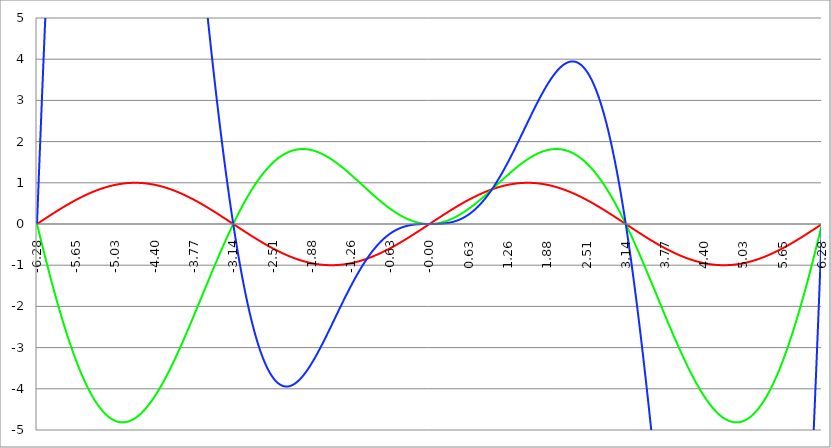
| Category | Series 1 | Series 0 | Series 2 | Series 3 | Series 4 |
|---|---|---|---|---|---|
| -6.283185307179586 | 0 | 0 | 0 |  |  |
| -6.276902121872407 | 0.006 | -0.039 | 0.248 |  |  |
| -6.270618936565228 | 0.013 | -0.079 | 0.494 |  |  |
| -6.264335751258049 | 0.019 | -0.118 | 0.74 |  |  |
| -6.25805256595087 | 0.025 | -0.157 | 0.984 |  |  |
| -6.25176938064369 | 0.031 | -0.196 | 1.228 |  |  |
| -6.245486195336511 | 0.038 | -0.235 | 1.47 |  |  |
| -6.23920301002933 | 0.044 | -0.274 | 1.712 |  |  |
| -6.232919824722153 | 0.05 | -0.313 | 1.952 |  |  |
| -6.226636639414973 | 0.057 | -0.352 | 2.191 |  |  |
| -6.220353454107794 | 0.063 | -0.391 | 2.43 |  |  |
| -6.214070268800615 | 0.069 | -0.429 | 2.667 |  |  |
| -6.207787083493435 | 0.075 | -0.468 | 2.903 |  |  |
| -6.201503898186257 | 0.082 | -0.506 | 3.138 |  |  |
| -6.195220712879077 | 0.088 | -0.544 | 3.372 |  |  |
| -6.188937527571898 | 0.094 | -0.582 | 3.605 |  |  |
| -6.182654342264719 | 0.1 | -0.621 | 3.836 |  |  |
| -6.17637115695754 | 0.107 | -0.658 | 4.067 |  |  |
| -6.170087971650361 | 0.113 | -0.696 | 4.296 |  |  |
| -6.163804786343182 | 0.119 | -0.734 | 4.525 |  |  |
| -6.157521601036002 | 0.125 | -0.772 | 4.752 |  |  |
| -6.151238415728823 | 0.132 | -0.809 | 4.978 |  |  |
| -6.144955230421644 | 0.138 | -0.847 | 5.203 |  |  |
| -6.138672045114464 | 0.144 | -0.884 | 5.427 |  |  |
| -6.132388859807286 | 0.15 | -0.921 | 5.649 |  |  |
| -6.126105674500106 | 0.156 | -0.958 | 5.871 |  |  |
| -6.119822489192927 | 0.163 | -0.995 | 6.091 |  |  |
| -6.113539303885748 | 0.169 | -1.032 | 6.31 |  |  |
| -6.107256118578569 | 0.175 | -1.069 | 6.528 |  |  |
| -6.10097293327139 | 0.181 | -1.106 | 6.745 |  |  |
| -6.09468974796421 | 0.187 | -1.142 | 6.96 |  |  |
| -6.088406562657031 | 0.194 | -1.178 | 7.175 |  |  |
| -6.082123377349852 | 0.2 | -1.215 | 7.388 |  |  |
| -6.075840192042672 | 0.206 | -1.251 | 7.6 |  |  |
| -6.069557006735494 | 0.212 | -1.287 | 7.81 |  |  |
| -6.063273821428314 | 0.218 | -1.323 | 8.02 |  |  |
| -6.056990636121135 | 0.224 | -1.358 | 8.228 |  |  |
| -6.050707450813956 | 0.23 | -1.394 | 8.435 |  |  |
| -6.044424265506777 | 0.236 | -1.43 | 8.641 |  |  |
| -6.038141080199597 | 0.243 | -1.465 | 8.845 |  |  |
| -6.031857894892418 | 0.249 | -1.5 | 9.048 |  |  |
| -6.025574709585239 | 0.255 | -1.535 | 9.25 |  |  |
| -6.01929152427806 | 0.261 | -1.57 | 9.451 |  |  |
| -6.013008338970881 | 0.267 | -1.605 | 9.65 |  |  |
| -6.006725153663701 | 0.273 | -1.64 | 9.848 |  |  |
| -6.000441968356522 | 0.279 | -1.674 | 10.045 |  |  |
| -5.994158783049343 | 0.285 | -1.708 | 10.241 |  |  |
| -5.987875597742164 | 0.291 | -1.743 | 10.435 |  |  |
| -5.981592412434984 | 0.297 | -1.777 | 10.628 |  |  |
| -5.975309227127805 | 0.303 | -1.811 | 10.82 |  |  |
| -5.969026041820626 | 0.309 | -1.845 | 11.01 |  |  |
| -5.962742856513447 | 0.315 | -1.878 | 11.199 |  |  |
| -5.956459671206268 | 0.321 | -1.912 | 11.387 |  |  |
| -5.950176485899088 | 0.327 | -1.945 | 11.573 |  |  |
| -5.94389330059191 | 0.333 | -1.978 | 11.758 |  |  |
| -5.93761011528473 | 0.339 | -2.011 | 11.942 |  |  |
| -5.931326929977551 | 0.345 | -2.044 | 12.125 |  |  |
| -5.925043744670372 | 0.351 | -2.077 | 12.306 |  |  |
| -5.918760559363193 | 0.356 | -2.11 | 12.486 |  |  |
| -5.912477374056014 | 0.362 | -2.142 | 12.664 |  |  |
| -5.906194188748834 | 0.368 | -2.174 | 12.841 |  |  |
| -5.899911003441655 | 0.374 | -2.206 | 13.017 |  |  |
| -5.893627818134476 | 0.38 | -2.238 | 13.192 |  |  |
| -5.887344632827297 | 0.386 | -2.27 | 13.365 |  |  |
| -5.881061447520117 | 0.391 | -2.302 | 13.536 |  |  |
| -5.874778262212938 | 0.397 | -2.333 | 13.707 |  |  |
| -5.868495076905759 | 0.403 | -2.364 | 13.876 |  |  |
| -5.86221189159858 | 0.409 | -2.396 | 14.043 |  |  |
| -5.855928706291401 | 0.414 | -2.427 | 14.21 |  |  |
| -5.849645520984221 | 0.42 | -2.457 | 14.375 |  |  |
| -5.843362335677042 | 0.426 | -2.488 | 14.538 |  |  |
| -5.837079150369863 | 0.431 | -2.518 | 14.7 |  |  |
| -5.830795965062684 | 0.437 | -2.549 | 14.861 |  |  |
| -5.824512779755505 | 0.443 | -2.579 | 15.021 |  |  |
| -5.818229594448325 | 0.448 | -2.609 | 15.179 |  |  |
| -5.811946409141146 | 0.454 | -2.639 | 15.335 |  |  |
| -5.805663223833967 | 0.46 | -2.668 | 15.49 |  |  |
| -5.799380038526788 | 0.465 | -2.698 | 15.644 |  |  |
| -5.793096853219609 | 0.471 | -2.727 | 15.797 |  |  |
| -5.78681366791243 | 0.476 | -2.756 | 15.948 |  |  |
| -5.780530482605251 | 0.482 | -2.785 | 16.098 |  |  |
| -5.774247297298071 | 0.487 | -2.814 | 16.246 |  |  |
| -5.767964111990892 | 0.493 | -2.842 | 16.393 |  |  |
| -5.761680926683713 | 0.498 | -2.87 | 16.538 |  |  |
| -5.755397741376534 | 0.504 | -2.899 | 16.682 |  |  |
| -5.749114556069355 | 0.509 | -2.927 | 16.825 |  |  |
| -5.742831370762175 | 0.514 | -2.954 | 16.966 |  |  |
| -5.736548185454996 | 0.52 | -2.982 | 17.106 |  |  |
| -5.730265000147816 | 0.525 | -3.009 | 17.245 |  |  |
| -5.723981814840638 | 0.531 | -3.037 | 17.382 |  |  |
| -5.717698629533459 | 0.536 | -3.064 | 17.517 |  |  |
| -5.711415444226279 | 0.541 | -3.091 | 17.652 |  |  |
| -5.7051322589191 | 0.546 | -3.117 | 17.784 |  |  |
| -5.698849073611921 | 0.552 | -3.144 | 17.916 |  |  |
| -5.692565888304742 | 0.557 | -3.17 | 18.046 |  |  |
| -5.686282702997562 | 0.562 | -3.196 | 18.174 |  |  |
| -5.679999517690383 | 0.567 | -3.222 | 18.301 |  |  |
| -5.673716332383204 | 0.572 | -3.248 | 18.427 |  |  |
| -5.667433147076025 | 0.578 | -3.273 | 18.552 |  |  |
| -5.661149961768846 | 0.583 | -3.299 | 18.674 |  |  |
| -5.654866776461667 | 0.588 | -3.324 | 18.796 |  |  |
| -5.648583591154487 | 0.593 | -3.349 | 18.916 |  |  |
| -5.642300405847308 | 0.598 | -3.374 | 19.035 |  |  |
| -5.63601722054013 | 0.603 | -3.398 | 19.152 |  |  |
| -5.62973403523295 | 0.608 | -3.422 | 19.268 |  |  |
| -5.623450849925771 | 0.613 | -3.447 | 19.382 |  |  |
| -5.617167664618591 | 0.618 | -3.471 | 19.495 |  |  |
| -5.610884479311412 | 0.623 | -3.494 | 19.607 |  |  |
| -5.604601294004233 | 0.628 | -3.518 | 19.717 |  |  |
| -5.598318108697054 | 0.633 | -3.541 | 19.825 |  |  |
| -5.592034923389875 | 0.637 | -3.564 | 19.933 |  |  |
| -5.585751738082695 | 0.642 | -3.587 | 20.039 |  |  |
| -5.579468552775516 | 0.647 | -3.61 | 20.143 |  |  |
| -5.573185367468337 | 0.652 | -3.633 | 20.246 |  |  |
| -5.566902182161157 | 0.657 | -3.655 | 20.348 |  |  |
| -5.560618996853979 | 0.661 | -3.677 | 20.448 |  |  |
| -5.5543358115468 | 0.666 | -3.699 | 20.547 |  |  |
| -5.54805262623962 | 0.671 | -3.721 | 20.644 |  |  |
| -5.54176944093244 | 0.675 | -3.743 | 20.74 |  |  |
| -5.535486255625262 | 0.68 | -3.764 | 20.835 |  |  |
| -5.529203070318083 | 0.685 | -3.785 | 20.928 |  |  |
| -5.522919885010904 | 0.689 | -3.806 | 21.02 |  |  |
| -5.516636699703724 | 0.694 | -3.827 | 21.11 |  |  |
| -5.510353514396545 | 0.698 | -3.847 | 21.199 |  |  |
| -5.504070329089366 | 0.703 | -3.867 | 21.287 |  |  |
| -5.497787143782186 | 0.707 | -3.888 | 21.373 |  |  |
| -5.491503958475008 | 0.712 | -3.907 | 21.458 |  |  |
| -5.485220773167828 | 0.716 | -3.927 | 21.541 |  |  |
| -5.47893758786065 | 0.72 | -3.947 | 21.623 |  |  |
| -5.47265440255347 | 0.725 | -3.966 | 21.703 |  |  |
| -5.466371217246291 | 0.729 | -3.985 | 21.782 |  |  |
| -5.460088031939112 | 0.733 | -4.004 | 21.86 |  |  |
| -5.453804846631932 | 0.738 | -4.022 | 21.937 |  |  |
| -5.447521661324753 | 0.742 | -4.041 | 22.012 |  |  |
| -5.441238476017574 | 0.746 | -4.059 | 22.085 |  |  |
| -5.434955290710395 | 0.75 | -4.077 | 22.157 |  |  |
| -5.428672105403215 | 0.754 | -4.095 | 22.228 |  |  |
| -5.422388920096036 | 0.758 | -4.112 | 22.298 |  |  |
| -5.416105734788857 | 0.762 | -4.129 | 22.366 |  |  |
| -5.409822549481678 | 0.766 | -4.147 | 22.432 |  |  |
| -5.403539364174499 | 0.771 | -4.163 | 22.498 |  |  |
| -5.39725617886732 | 0.775 | -4.18 | 22.562 |  |  |
| -5.39097299356014 | 0.778 | -4.197 | 22.624 |  |  |
| -5.384689808252961 | 0.782 | -4.213 | 22.685 |  |  |
| -5.378406622945782 | 0.786 | -4.229 | 22.745 |  |  |
| -5.372123437638603 | 0.79 | -4.245 | 22.804 |  |  |
| -5.365840252331424 | 0.794 | -4.26 | 22.861 |  |  |
| -5.359557067024244 | 0.798 | -4.276 | 22.917 |  |  |
| -5.353273881717065 | 0.802 | -4.291 | 22.971 |  |  |
| -5.346990696409886 | 0.805 | -4.306 | 23.024 |  |  |
| -5.340707511102707 | 0.809 | -4.321 | 23.076 |  |  |
| -5.334424325795528 | 0.813 | -4.335 | 23.126 |  |  |
| -5.328141140488348 | 0.816 | -4.35 | 23.175 |  |  |
| -5.32185795518117 | 0.82 | -4.364 | 23.223 |  |  |
| -5.31557476987399 | 0.824 | -4.378 | 23.269 |  |  |
| -5.30929158456681 | 0.827 | -4.391 | 23.314 |  |  |
| -5.303008399259631 | 0.831 | -4.405 | 23.358 |  |  |
| -5.296725213952453 | 0.834 | -4.418 | 23.4 |  |  |
| -5.290442028645273 | 0.838 | -4.431 | 23.441 |  |  |
| -5.284158843338094 | 0.841 | -4.444 | 23.481 |  |  |
| -5.277875658030915 | 0.844 | -4.456 | 23.52 |  |  |
| -5.271592472723735 | 0.848 | -4.469 | 23.557 |  |  |
| -5.265309287416557 | 0.851 | -4.481 | 23.593 |  |  |
| -5.259026102109377 | 0.854 | -4.493 | 23.627 |  |  |
| -5.252742916802198 | 0.858 | -4.504 | 23.66 |  |  |
| -5.246459731495019 | 0.861 | -4.516 | 23.692 |  |  |
| -5.24017654618784 | 0.864 | -4.527 | 23.723 |  |  |
| -5.23389336088066 | 0.867 | -4.538 | 23.752 |  |  |
| -5.227610175573481 | 0.87 | -4.549 | 23.78 |  |  |
| -5.221326990266302 | 0.873 | -4.56 | 23.807 |  |  |
| -5.215043804959122 | 0.876 | -4.57 | 23.833 |  |  |
| -5.208760619651944 | 0.879 | -4.58 | 23.857 |  |  |
| -5.202477434344764 | 0.882 | -4.59 | 23.88 |  |  |
| -5.196194249037585 | 0.885 | -4.6 | 23.902 |  |  |
| -5.189911063730406 | 0.888 | -4.609 | 23.922 |  |  |
| -5.183627878423227 | 0.891 | -4.619 | 23.941 |  |  |
| -5.177344693116048 | 0.894 | -4.628 | 23.959 |  |  |
| -5.171061507808868 | 0.897 | -4.637 | 23.976 |  |  |
| -5.164778322501689 | 0.899 | -4.645 | 23.992 |  |  |
| -5.15849513719451 | 0.902 | -4.654 | 24.006 |  |  |
| -5.152211951887331 | 0.905 | -4.662 | 24.019 |  |  |
| -5.145928766580152 | 0.907 | -4.67 | 24.031 |  |  |
| -5.139645581272972 | 0.91 | -4.678 | 24.041 |  |  |
| -5.133362395965793 | 0.913 | -4.685 | 24.051 |  |  |
| -5.127079210658614 | 0.915 | -4.693 | 24.059 |  |  |
| -5.120796025351435 | 0.918 | -4.7 | 24.066 |  |  |
| -5.114512840044256 | 0.92 | -4.707 | 24.072 |  |  |
| -5.108229654737076 | 0.923 | -4.713 | 24.076 |  |  |
| -5.101946469429897 | 0.925 | -4.72 | 24.08 |  |  |
| -5.095663284122718 | 0.927 | -4.726 | 24.082 |  |  |
| -5.08938009881554 | 0.93 | -4.732 | 24.083 |  |  |
| -5.08309691350836 | 0.932 | -4.738 | 24.083 |  |  |
| -5.07681372820118 | 0.934 | -4.743 | 24.081 |  |  |
| -5.070530542894002 | 0.937 | -4.749 | 24.079 |  |  |
| -5.064247357586822 | 0.939 | -4.754 | 24.075 |  |  |
| -5.057964172279643 | 0.941 | -4.759 | 24.071 |  |  |
| -5.051680986972464 | 0.943 | -4.764 | 24.065 |  |  |
| -5.045397801665285 | 0.945 | -4.768 | 24.058 |  |  |
| -5.039114616358106 | 0.947 | -4.773 | 24.049 |  |  |
| -5.032831431050926 | 0.949 | -4.777 | 24.04 |  |  |
| -5.026548245743747 | 0.951 | -4.781 | 24.03 |  |  |
| -5.020265060436568 | 0.953 | -4.784 | 24.018 |  |  |
| -5.013981875129389 | 0.955 | -4.788 | 24.005 |  |  |
| -5.00769868982221 | 0.957 | -4.791 | 23.992 |  |  |
| -5.00141550451503 | 0.959 | -4.794 | 23.977 |  |  |
| -4.995132319207851 | 0.96 | -4.797 | 23.961 |  |  |
| -4.98884913390067 | 0.962 | -4.799 | 23.944 |  |  |
| -4.982565948593493 | 0.964 | -4.802 | 23.925 |  |  |
| -4.976282763286313 | 0.965 | -4.804 | 23.906 |  |  |
| -4.969999577979134 | 0.967 | -4.806 | 23.886 |  |  |
| -4.963716392671955 | 0.969 | -4.808 | 23.864 |  |  |
| -4.957433207364776 | 0.97 | -4.809 | 23.842 |  |  |
| -4.951150022057597 | 0.972 | -4.811 | 23.818 |  |  |
| -4.944866836750418 | 0.973 | -4.812 | 23.794 |  |  |
| -4.938583651443238 | 0.975 | -4.813 | 23.768 |  |  |
| -4.932300466136059 | 0.976 | -4.814 | 23.742 |  |  |
| -4.92601728082888 | 0.977 | -4.814 | 23.714 |  |  |
| -4.9197340955217 | 0.979 | -4.814 | 23.685 |  |  |
| -4.913450910214521 | 0.98 | -4.814 | 23.656 |  |  |
| -4.907167724907342 | 0.981 | -4.814 | 23.625 |  |  |
| -4.900884539600163 | 0.982 | -4.814 | 23.593 |  |  |
| -4.894601354292984 | 0.983 | -4.814 | 23.561 |  |  |
| -4.888318168985805 | 0.985 | -4.813 | 23.527 |  |  |
| -4.882034983678625 | 0.986 | -4.812 | 23.492 |  |  |
| -4.875751798371446 | 0.987 | -4.811 | 23.456 |  |  |
| -4.869468613064267 | 0.988 | -4.81 | 23.42 |  |  |
| -4.863185427757088 | 0.989 | -4.808 | 23.382 |  |  |
| -4.856902242449909 | 0.99 | -4.806 | 23.344 |  |  |
| -4.85061905714273 | 0.99 | -4.804 | 23.304 |  |  |
| -4.84433587183555 | 0.991 | -4.802 | 23.264 |  |  |
| -4.838052686528371 | 0.992 | -4.8 | 23.222 |  |  |
| -4.831769501221192 | 0.993 | -4.797 | 23.18 |  |  |
| -4.825486315914013 | 0.994 | -4.795 | 23.137 |  |  |
| -4.819203130606833 | 0.994 | -4.792 | 23.092 |  |  |
| -4.812919945299654 | 0.995 | -4.789 | 23.047 |  |  |
| -4.806636759992475 | 0.996 | -4.785 | 23.001 |  |  |
| -4.800353574685296 | 0.996 | -4.782 | 22.954 |  |  |
| -4.794070389378117 | 0.997 | -4.778 | 22.906 |  |  |
| -4.787787204070938 | 0.997 | -4.774 | 22.858 |  |  |
| -4.781504018763758 | 0.998 | -4.77 | 22.808 |  |  |
| -4.77522083345658 | 0.998 | -4.766 | 22.758 |  |  |
| -4.7689376481494 | 0.998 | -4.761 | 22.706 |  |  |
| -4.762654462842221 | 0.999 | -4.757 | 22.654 |  |  |
| -4.756371277535042 | 0.999 | -4.752 | 22.601 |  |  |
| -4.750088092227862 | 0.999 | -4.747 | 22.547 |  |  |
| -4.743804906920683 | 1 | -4.741 | 22.493 |  |  |
| -4.737521721613504 | 1 | -4.736 | 22.437 |  |  |
| -4.731238536306324 | 1 | -4.73 | 22.381 |  |  |
| -4.724955350999146 | 1 | -4.725 | 22.323 |  |  |
| -4.718672165691966 | 1 | -4.719 | 22.265 |  |  |
| -4.712388980384787 | 1 | -4.712 | 22.207 |  |  |
| -4.706105795077608 | 1 | -4.706 | 22.147 |  |  |
| -4.699822609770429 | 1 | -4.699 | 22.087 |  |  |
| -4.69353942446325 | 1 | -4.693 | 22.025 |  |  |
| -4.68725623915607 | 1 | -4.686 | 21.963 |  |  |
| -4.680973053848891 | 1 | -4.679 | 21.901 |  |  |
| -4.674689868541712 | 0.999 | -4.671 | 21.837 |  |  |
| -4.668406683234533 | 0.999 | -4.664 | 21.773 |  |  |
| -4.662123497927354 | 0.999 | -4.656 | 21.708 |  |  |
| -4.655840312620174 | 0.998 | -4.648 | 21.642 |  |  |
| -4.649557127312995 | 0.998 | -4.64 | 21.576 |  |  |
| -4.643273942005816 | 0.998 | -4.632 | 21.509 |  |  |
| -4.636990756698637 | 0.997 | -4.624 | 21.441 |  |  |
| -4.630707571391458 | 0.997 | -4.615 | 21.372 |  |  |
| -4.624424386084279 | 0.996 | -4.607 | 21.303 |  |  |
| -4.618141200777099 | 0.996 | -4.598 | 21.233 |  |  |
| -4.61185801546992 | 0.995 | -4.589 | 21.162 |  |  |
| -4.605574830162741 | 0.994 | -4.579 | 21.09 |  |  |
| -4.599291644855561 | 0.994 | -4.57 | 21.018 |  |  |
| -4.593008459548383 | 0.993 | -4.56 | 20.946 |  |  |
| -4.586725274241203 | 0.992 | -4.551 | 20.872 |  |  |
| -4.580442088934024 | 0.991 | -4.541 | 20.798 |  |  |
| -4.574158903626845 | 0.99 | -4.531 | 20.723 |  |  |
| -4.567875718319666 | 0.99 | -4.52 | 20.648 |  |  |
| -4.561592533012487 | 0.989 | -4.51 | 20.572 |  |  |
| -4.555309347705307 | 0.988 | -4.499 | 20.495 |  |  |
| -4.549026162398128 | 0.987 | -4.488 | 20.418 |  |  |
| -4.542742977090949 | 0.986 | -4.478 | 20.34 |  |  |
| -4.53645979178377 | 0.985 | -4.466 | 20.262 |  |  |
| -4.530176606476591 | 0.983 | -4.455 | 20.183 |  |  |
| -4.523893421169412 | 0.982 | -4.444 | 20.103 |  |  |
| -4.517610235862232 | 0.981 | -4.432 | 20.023 |  |  |
| -4.511327050555053 | 0.98 | -4.42 | 19.942 |  |  |
| -4.505043865247874 | 0.979 | -4.409 | 19.861 |  |  |
| -4.498760679940694 | 0.977 | -4.396 | 19.779 |  |  |
| -4.492477494633515 | 0.976 | -4.384 | 19.696 |  |  |
| -4.486194309326336 | 0.975 | -4.372 | 19.613 |  |  |
| -4.479911124019157 | 0.973 | -4.359 | 19.53 |  |  |
| -4.473627938711977 | 0.972 | -4.347 | 19.446 |  |  |
| -4.467344753404799 | 0.97 | -4.334 | 19.361 |  |  |
| -4.46106156809762 | 0.969 | -4.321 | 19.276 |  |  |
| -4.45477838279044 | 0.967 | -4.308 | 19.19 |  |  |
| -4.44849519748326 | 0.965 | -4.294 | 19.104 |  |  |
| -4.442212012176082 | 0.964 | -4.281 | 19.017 |  |  |
| -4.435928826868903 | 0.962 | -4.267 | 18.93 |  |  |
| -4.429645641561723 | 0.96 | -4.254 | 18.843 |  |  |
| -4.423362456254544 | 0.959 | -4.24 | 18.755 |  |  |
| -4.417079270947365 | 0.957 | -4.226 | 18.666 |  |  |
| -4.410796085640185 | 0.955 | -4.212 | 18.577 |  |  |
| -4.404512900333007 | 0.953 | -4.197 | 18.488 |  |  |
| -4.398229715025827 | 0.951 | -4.183 | 18.398 |  |  |
| -4.391946529718648 | 0.949 | -4.168 | 18.307 |  |  |
| -4.38566334441147 | 0.947 | -4.154 | 18.217 |  |  |
| -4.37938015910429 | 0.945 | -4.139 | 18.125 |  |  |
| -4.373096973797111 | 0.943 | -4.124 | 18.034 |  |  |
| -4.366813788489932 | 0.941 | -4.109 | 17.942 |  |  |
| -4.360530603182752 | 0.939 | -4.093 | 17.849 |  |  |
| -4.354247417875573 | 0.937 | -4.078 | 17.756 |  |  |
| -4.347964232568394 | 0.934 | -4.062 | 17.663 |  |  |
| -4.341681047261215 | 0.932 | -4.047 | 17.57 |  |  |
| -4.335397861954035 | 0.93 | -4.031 | 17.476 |  |  |
| -4.329114676646856 | 0.927 | -4.015 | 17.381 |  |  |
| -4.322831491339677 | 0.925 | -3.999 | 17.287 |  |  |
| -4.316548306032498 | 0.923 | -3.983 | 17.192 |  |  |
| -4.310265120725319 | 0.92 | -3.966 | 17.096 |  |  |
| -4.30398193541814 | 0.918 | -3.95 | 17.001 |  |  |
| -4.29769875011096 | 0.915 | -3.933 | 16.905 |  |  |
| -4.291415564803781 | 0.913 | -3.917 | 16.808 |  |  |
| -4.285132379496602 | 0.91 | -3.9 | 16.712 |  |  |
| -4.278849194189422 | 0.907 | -3.883 | 16.615 |  |  |
| -4.272566008882244 | 0.905 | -3.866 | 16.517 |  |  |
| -4.266282823575064 | 0.902 | -3.849 | 16.42 |  |  |
| -4.259999638267885 | 0.899 | -3.831 | 16.322 |  |  |
| -4.253716452960706 | 0.897 | -3.814 | 16.224 |  |  |
| -4.247433267653527 | 0.894 | -3.797 | 16.126 |  |  |
| -4.241150082346347 | 0.891 | -3.779 | 16.027 |  |  |
| -4.234866897039168 | 0.888 | -3.761 | 15.928 |  |  |
| -4.228583711731989 | 0.885 | -3.743 | 15.829 |  |  |
| -4.22230052642481 | 0.882 | -3.725 | 15.729 |  |  |
| -4.216017341117631 | 0.879 | -3.707 | 15.63 |  |  |
| -4.209734155810452 | 0.876 | -3.689 | 15.53 |  |  |
| -4.203450970503273 | 0.873 | -3.671 | 15.43 |  |  |
| -4.197167785196093 | 0.87 | -3.652 | 15.329 |  |  |
| -4.190884599888914 | 0.867 | -3.634 | 15.229 |  |  |
| -4.184601414581734 | 0.864 | -3.615 | 15.128 |  |  |
| -4.178318229274556 | 0.861 | -3.596 | 15.027 |  |  |
| -4.172035043967377 | 0.858 | -3.578 | 14.926 |  |  |
| -4.165751858660197 | 0.854 | -3.559 | 14.825 |  |  |
| -4.159468673353018 | 0.851 | -3.54 | 14.723 |  |  |
| -4.153185488045839 | 0.848 | -3.521 | 14.622 |  |  |
| -4.14690230273866 | 0.844 | -3.501 | 14.52 |  |  |
| -4.140619117431481 | 0.841 | -3.482 | 14.418 |  |  |
| -4.134335932124301 | 0.838 | -3.463 | 14.316 |  |  |
| -4.128052746817122 | 0.834 | -3.443 | 14.213 |  |  |
| -4.121769561509943 | 0.831 | -3.424 | 14.111 |  |  |
| -4.115486376202764 | 0.827 | -3.404 | 14.008 |  |  |
| -4.109203190895584 | 0.824 | -3.384 | 13.906 |  |  |
| -4.102920005588405 | 0.82 | -3.364 | 13.803 |  |  |
| -4.096636820281226 | 0.816 | -3.344 | 13.7 |  |  |
| -4.090353634974047 | 0.813 | -3.324 | 13.597 |  |  |
| -4.084070449666868 | 0.809 | -3.304 | 13.494 |  |  |
| -4.077787264359689 | 0.805 | -3.284 | 13.391 |  |  |
| -4.071504079052509 | 0.802 | -3.264 | 13.288 |  |  |
| -4.06522089374533 | 0.798 | -3.243 | 13.184 |  |  |
| -4.058937708438151 | 0.794 | -3.223 | 13.081 |  |  |
| -4.052654523130972 | 0.79 | -3.202 | 12.978 |  |  |
| -4.046371337823793 | 0.786 | -3.182 | 12.874 |  |  |
| -4.040088152516613 | 0.782 | -3.161 | 12.77 |  |  |
| -4.033804967209434 | 0.778 | -3.14 | 12.667 |  |  |
| -4.027521781902255 | 0.775 | -3.119 | 12.563 |  |  |
| -4.021238596595076 | 0.771 | -3.098 | 12.459 |  |  |
| -4.014955411287897 | 0.766 | -3.077 | 12.356 |  |  |
| -4.008672225980717 | 0.762 | -3.056 | 12.252 |  |  |
| -4.002389040673538 | 0.758 | -3.035 | 12.148 |  |  |
| -3.996105855366359 | 0.754 | -3.014 | 12.045 |  |  |
| -3.989822670059179 | 0.75 | -2.993 | 11.941 |  |  |
| -3.983539484752 | 0.746 | -2.971 | 11.837 |  |  |
| -3.97725629944482 | 0.742 | -2.95 | 11.733 |  |  |
| -3.97097311413764 | 0.738 | -2.929 | 11.63 |  |  |
| -3.96468992883046 | 0.733 | -2.907 | 11.526 |  |  |
| -3.958406743523281 | 0.729 | -2.886 | 11.422 |  |  |
| -3.952123558216101 | 0.725 | -2.864 | 11.319 |  |  |
| -3.945840372908922 | 0.72 | -2.842 | 11.215 |  |  |
| -3.939557187601742 | 0.716 | -2.82 | 11.111 |  |  |
| -3.933274002294562 | 0.712 | -2.799 | 11.008 |  |  |
| -3.926990816987382 | 0.707 | -2.777 | 10.904 |  |  |
| -3.920707631680203 | 0.703 | -2.755 | 10.801 |  |  |
| -3.914424446373023 | 0.698 | -2.733 | 10.698 |  |  |
| -3.908141261065844 | 0.694 | -2.711 | 10.595 |  |  |
| -3.901858075758664 | 0.689 | -2.689 | 10.491 |  |  |
| -3.895574890451484 | 0.685 | -2.667 | 10.388 |  |  |
| -3.889291705144305 | 0.68 | -2.645 | 10.285 |  |  |
| -3.883008519837125 | 0.675 | -2.622 | 10.183 |  |  |
| -3.876725334529945 | 0.671 | -2.6 | 10.08 |  |  |
| -3.870442149222766 | 0.666 | -2.578 | 9.977 |  |  |
| -3.864158963915586 | 0.661 | -2.555 | 9.875 |  |  |
| -3.857875778608407 | 0.657 | -2.533 | 9.772 |  |  |
| -3.851592593301227 | 0.652 | -2.511 | 9.67 |  |  |
| -3.845309407994047 | 0.647 | -2.488 | 9.568 |  |  |
| -3.839026222686868 | 0.642 | -2.466 | 9.466 |  |  |
| -3.832743037379688 | 0.637 | -2.443 | 9.364 |  |  |
| -3.826459852072508 | 0.633 | -2.421 | 9.262 |  |  |
| -3.820176666765329 | 0.628 | -2.398 | 9.16 |  |  |
| -3.813893481458149 | 0.623 | -2.375 | 9.059 |  |  |
| -3.807610296150969 | 0.618 | -2.353 | 8.958 |  |  |
| -3.80132711084379 | 0.613 | -2.33 | 8.857 |  |  |
| -3.79504392553661 | 0.608 | -2.307 | 8.756 |  |  |
| -3.78876074022943 | 0.603 | -2.284 | 8.655 |  |  |
| -3.782477554922251 | 0.598 | -2.262 | 8.554 |  |  |
| -3.776194369615071 | 0.593 | -2.239 | 8.454 |  |  |
| -3.769911184307892 | 0.588 | -2.216 | 8.354 |  |  |
| -3.763627999000712 | 0.583 | -2.193 | 8.254 |  |  |
| -3.757344813693532 | 0.578 | -2.17 | 8.154 |  |  |
| -3.751061628386352 | 0.572 | -2.147 | 8.054 |  |  |
| -3.744778443079173 | 0.567 | -2.124 | 7.955 |  |  |
| -3.738495257771993 | 0.562 | -2.101 | 7.856 |  |  |
| -3.732212072464814 | 0.557 | -2.078 | 7.757 |  |  |
| -3.725928887157634 | 0.552 | -2.055 | 7.658 |  |  |
| -3.719645701850454 | 0.546 | -2.032 | 7.56 |  |  |
| -3.713362516543275 | 0.541 | -2.009 | 7.462 |  |  |
| -3.707079331236095 | 0.536 | -1.986 | 7.364 |  |  |
| -3.700796145928915 | 0.531 | -1.963 | 7.266 |  |  |
| -3.694512960621736 | 0.525 | -1.94 | 7.168 |  |  |
| -3.688229775314556 | 0.52 | -1.917 | 7.071 |  |  |
| -3.681946590007376 | 0.514 | -1.894 | 6.974 |  |  |
| -3.675663404700197 | 0.509 | -1.871 | 6.877 |  |  |
| -3.669380219393017 | 0.504 | -1.848 | 6.781 |  |  |
| -3.663097034085838 | 0.498 | -1.825 | 6.685 |  |  |
| -3.656813848778658 | 0.493 | -1.802 | 6.589 |  |  |
| -3.650530663471478 | 0.487 | -1.779 | 6.493 |  |  |
| -3.644247478164299 | 0.482 | -1.756 | 6.398 |  |  |
| -3.63796429285712 | 0.476 | -1.733 | 6.303 |  |  |
| -3.631681107549939 | 0.471 | -1.709 | 6.208 |  |  |
| -3.62539792224276 | 0.465 | -1.686 | 6.114 |  |  |
| -3.61911473693558 | 0.46 | -1.663 | 6.02 |  |  |
| -3.612831551628401 | 0.454 | -1.64 | 5.926 |  |  |
| -3.606548366321221 | 0.448 | -1.617 | 5.832 |  |  |
| -3.600265181014041 | 0.443 | -1.594 | 5.739 |  |  |
| -3.593981995706862 | 0.437 | -1.571 | 5.646 |  |  |
| -3.587698810399682 | 0.431 | -1.548 | 5.554 |  |  |
| -3.581415625092502 | 0.426 | -1.525 | 5.461 |  |  |
| -3.575132439785323 | 0.42 | -1.502 | 5.369 |  |  |
| -3.568849254478143 | 0.414 | -1.479 | 5.278 |  |  |
| -3.562566069170964 | 0.409 | -1.456 | 5.187 |  |  |
| -3.556282883863784 | 0.403 | -1.433 | 5.096 |  |  |
| -3.549999698556604 | 0.397 | -1.41 | 5.005 |  |  |
| -3.543716513249425 | 0.391 | -1.387 | 4.915 |  |  |
| -3.537433327942245 | 0.386 | -1.364 | 4.825 |  |  |
| -3.531150142635065 | 0.38 | -1.341 | 4.735 |  |  |
| -3.524866957327886 | 0.374 | -1.318 | 4.646 |  |  |
| -3.518583772020706 | 0.368 | -1.295 | 4.558 |  |  |
| -3.512300586713526 | 0.362 | -1.272 | 4.469 |  |  |
| -3.506017401406347 | 0.356 | -1.25 | 4.381 |  |  |
| -3.499734216099167 | 0.351 | -1.227 | 4.293 |  |  |
| -3.493451030791987 | 0.345 | -1.204 | 4.206 |  |  |
| -3.487167845484808 | 0.339 | -1.181 | 4.119 |  |  |
| -3.480884660177628 | 0.333 | -1.159 | 4.033 |  |  |
| -3.474601474870449 | 0.327 | -1.136 | 3.946 |  |  |
| -3.468318289563269 | 0.321 | -1.113 | 3.861 |  |  |
| -3.462035104256089 | 0.315 | -1.09 | 3.775 |  |  |
| -3.45575191894891 | 0.309 | -1.068 | 3.69 |  |  |
| -3.44946873364173 | 0.303 | -1.045 | 3.606 |  |  |
| -3.44318554833455 | 0.297 | -1.023 | 3.522 |  |  |
| -3.436902363027371 | 0.291 | -1 | 3.438 |  |  |
| -3.430619177720191 | 0.285 | -0.978 | 3.354 |  |  |
| -3.424335992413011 | 0.279 | -0.955 | 3.271 |  |  |
| -3.418052807105832 | 0.273 | -0.933 | 3.189 |  |  |
| -3.411769621798652 | 0.267 | -0.911 | 3.107 |  |  |
| -3.405486436491473 | 0.261 | -0.888 | 3.025 |  |  |
| -3.399203251184293 | 0.255 | -0.866 | 2.944 |  |  |
| -3.392920065877113 | 0.249 | -0.844 | 2.863 |  |  |
| -3.386636880569934 | 0.243 | -0.822 | 2.782 |  |  |
| -3.380353695262754 | 0.236 | -0.799 | 2.702 |  |  |
| -3.374070509955574 | 0.23 | -0.777 | 2.623 |  |  |
| -3.367787324648395 | 0.224 | -0.755 | 2.544 |  |  |
| -3.361504139341215 | 0.218 | -0.733 | 2.465 |  |  |
| -3.355220954034035 | 0.212 | -0.711 | 2.387 |  |  |
| -3.348937768726855 | 0.206 | -0.689 | 2.309 |  |  |
| -3.342654583419676 | 0.2 | -0.668 | 2.231 |  |  |
| -3.336371398112496 | 0.194 | -0.646 | 2.154 |  |  |
| -3.330088212805317 | 0.187 | -0.624 | 2.078 |  |  |
| -3.323805027498137 | 0.181 | -0.602 | 2.002 |  |  |
| -3.317521842190957 | 0.175 | -0.581 | 1.926 |  |  |
| -3.311238656883778 | 0.169 | -0.559 | 1.851 |  |  |
| -3.304955471576598 | 0.163 | -0.538 | 1.776 |  |  |
| -3.298672286269419 | 0.156 | -0.516 | 1.702 |  |  |
| -3.292389100962239 | 0.15 | -0.495 | 1.628 |  |  |
| -3.286105915655059 | 0.144 | -0.473 | 1.555 |  |  |
| -3.27982273034788 | 0.138 | -0.452 | 1.482 |  |  |
| -3.2735395450407 | 0.132 | -0.431 | 1.41 |  |  |
| -3.26725635973352 | 0.125 | -0.409 | 1.338 |  |  |
| -3.260973174426341 | 0.119 | -0.388 | 1.266 |  |  |
| -3.254689989119161 | 0.113 | -0.367 | 1.195 |  |  |
| -3.248406803811982 | 0.107 | -0.346 | 1.125 |  |  |
| -3.242123618504802 | 0.1 | -0.325 | 1.055 |  |  |
| -3.235840433197622 | 0.094 | -0.305 | 0.985 |  |  |
| -3.229557247890442 | 0.088 | -0.284 | 0.916 |  |  |
| -3.223274062583263 | 0.082 | -0.263 | 0.848 |  |  |
| -3.216990877276083 | 0.075 | -0.242 | 0.78 |  |  |
| -3.210707691968904 | 0.069 | -0.222 | 0.712 |  |  |
| -3.204424506661724 | 0.063 | -0.201 | 0.645 |  |  |
| -3.198141321354544 | 0.057 | -0.181 | 0.578 |  |  |
| -3.191858136047365 | 0.05 | -0.16 | 0.512 |  |  |
| -3.185574950740185 | 0.044 | -0.14 | 0.446 |  |  |
| -3.179291765433005 | 0.038 | -0.12 | 0.381 |  |  |
| -3.173008580125826 | 0.031 | -0.1 | 0.316 |  |  |
| -3.166725394818646 | 0.025 | -0.08 | 0.252 |  |  |
| -3.160442209511467 | 0.019 | -0.06 | 0.188 |  |  |
| -3.154159024204287 | 0.013 | -0.04 | 0.125 |  |  |
| -3.147875838897107 | 0.006 | -0.02 | 0.062 |  |  |
| -3.141592653589928 | 0 | 0 | 0 |  |  |
| -3.135309468282748 | -0.006 | 0.02 | -0.062 |  |  |
| -3.129026282975568 | -0.013 | 0.039 | -0.123 |  |  |
| -3.122743097668389 | -0.019 | 0.059 | -0.184 |  |  |
| -3.116459912361209 | -0.025 | 0.078 | -0.244 |  |  |
| -3.110176727054029 | -0.031 | 0.098 | -0.304 |  |  |
| -3.10389354174685 | -0.038 | 0.117 | -0.363 |  |  |
| -3.09761035643967 | -0.044 | 0.136 | -0.422 |  |  |
| -3.09132717113249 | -0.05 | 0.155 | -0.48 |  |  |
| -3.085043985825311 | -0.057 | 0.174 | -0.538 |  |  |
| -3.078760800518131 | -0.063 | 0.193 | -0.595 |  |  |
| -3.072477615210952 | -0.069 | 0.212 | -0.652 |  |  |
| -3.066194429903772 | -0.075 | 0.231 | -0.708 |  |  |
| -3.059911244596592 | -0.082 | 0.25 | -0.764 |  |  |
| -3.053628059289413 | -0.088 | 0.268 | -0.819 |  |  |
| -3.047344873982233 | -0.094 | 0.287 | -0.874 |  |  |
| -3.041061688675053 | -0.1 | 0.305 | -0.928 |  |  |
| -3.034778503367874 | -0.107 | 0.324 | -0.982 |  |  |
| -3.028495318060694 | -0.113 | 0.342 | -1.035 |  |  |
| -3.022212132753515 | -0.119 | 0.36 | -1.088 |  |  |
| -3.015928947446335 | -0.125 | 0.378 | -1.14 |  |  |
| -3.009645762139155 | -0.132 | 0.396 | -1.192 |  |  |
| -3.003362576831975 | -0.138 | 0.414 | -1.243 |  |  |
| -2.997079391524796 | -0.144 | 0.432 | -1.294 |  |  |
| -2.990796206217616 | -0.15 | 0.449 | -1.344 |  |  |
| -2.984513020910436 | -0.156 | 0.467 | -1.393 |  |  |
| -2.978229835603257 | -0.163 | 0.484 | -1.443 |  |  |
| -2.971946650296077 | -0.169 | 0.502 | -1.491 |  |  |
| -2.965663464988898 | -0.175 | 0.519 | -1.539 |  |  |
| -2.959380279681718 | -0.181 | 0.536 | -1.587 |  |  |
| -2.953097094374538 | -0.187 | 0.553 | -1.634 |  |  |
| -2.946813909067359 | -0.194 | 0.57 | -1.681 |  |  |
| -2.94053072376018 | -0.2 | 0.587 | -1.727 |  |  |
| -2.934247538453 | -0.206 | 0.604 | -1.772 |  |  |
| -2.92796435314582 | -0.212 | 0.621 | -1.818 |  |  |
| -2.92168116783864 | -0.218 | 0.637 | -1.862 |  |  |
| -2.915397982531461 | -0.224 | 0.654 | -1.906 |  |  |
| -2.909114797224281 | -0.23 | 0.67 | -1.95 |  |  |
| -2.902831611917101 | -0.236 | 0.687 | -1.993 |  |  |
| -2.896548426609922 | -0.243 | 0.703 | -2.035 |  |  |
| -2.890265241302742 | -0.249 | 0.719 | -2.077 |  |  |
| -2.883982055995562 | -0.255 | 0.735 | -2.119 |  |  |
| -2.877698870688383 | -0.261 | 0.751 | -2.16 |  |  |
| -2.871415685381203 | -0.267 | 0.766 | -2.201 |  |  |
| -2.865132500074023 | -0.273 | 0.782 | -2.241 |  |  |
| -2.858849314766844 | -0.279 | 0.798 | -2.28 |  |  |
| -2.852566129459664 | -0.285 | 0.813 | -2.319 |  |  |
| -2.846282944152485 | -0.291 | 0.828 | -2.358 |  |  |
| -2.839999758845305 | -0.297 | 0.844 | -2.396 |  |  |
| -2.833716573538125 | -0.303 | 0.859 | -2.433 |  |  |
| -2.827433388230946 | -0.309 | 0.874 | -2.47 |  |  |
| -2.821150202923766 | -0.315 | 0.889 | -2.507 |  |  |
| -2.814867017616586 | -0.321 | 0.903 | -2.543 |  |  |
| -2.808583832309407 | -0.327 | 0.918 | -2.579 |  |  |
| -2.802300647002227 | -0.333 | 0.933 | -2.614 |  |  |
| -2.796017461695047 | -0.339 | 0.947 | -2.648 |  |  |
| -2.789734276387867 | -0.345 | 0.961 | -2.682 |  |  |
| -2.783451091080688 | -0.351 | 0.976 | -2.716 |  |  |
| -2.777167905773509 | -0.356 | 0.99 | -2.749 |  |  |
| -2.770884720466329 | -0.362 | 1.004 | -2.781 |  |  |
| -2.764601535159149 | -0.368 | 1.018 | -2.814 |  |  |
| -2.75831834985197 | -0.374 | 1.031 | -2.845 |  |  |
| -2.75203516454479 | -0.38 | 1.045 | -2.876 |  |  |
| -2.74575197923761 | -0.386 | 1.059 | -2.907 |  |  |
| -2.739468793930431 | -0.391 | 1.072 | -2.937 |  |  |
| -2.733185608623251 | -0.397 | 1.085 | -2.967 |  |  |
| -2.726902423316071 | -0.403 | 1.099 | -2.996 |  |  |
| -2.720619238008892 | -0.409 | 1.112 | -3.025 |  |  |
| -2.714336052701712 | -0.414 | 1.125 | -3.053 |  |  |
| -2.708052867394532 | -0.42 | 1.138 | -3.081 |  |  |
| -2.701769682087352 | -0.426 | 1.15 | -3.108 |  |  |
| -2.695486496780173 | -0.431 | 1.163 | -3.135 |  |  |
| -2.689203311472993 | -0.437 | 1.175 | -3.161 |  |  |
| -2.682920126165814 | -0.443 | 1.188 | -3.187 |  |  |
| -2.676636940858634 | -0.448 | 1.2 | -3.212 |  |  |
| -2.670353755551454 | -0.454 | 1.212 | -3.237 |  |  |
| -2.664070570244275 | -0.46 | 1.224 | -3.262 |  |  |
| -2.657787384937095 | -0.465 | 1.236 | -3.286 |  |  |
| -2.651504199629916 | -0.471 | 1.248 | -3.309 |  |  |
| -2.645221014322736 | -0.476 | 1.26 | -3.332 |  |  |
| -2.638937829015556 | -0.482 | 1.271 | -3.355 |  |  |
| -2.632654643708377 | -0.487 | 1.283 | -3.377 |  |  |
| -2.626371458401197 | -0.493 | 1.294 | -3.399 |  |  |
| -2.620088273094018 | -0.498 | 1.305 | -3.42 |  |  |
| -2.613805087786838 | -0.504 | 1.316 | -3.441 |  |  |
| -2.607521902479658 | -0.509 | 1.327 | -3.461 |  |  |
| -2.601238717172478 | -0.514 | 1.338 | -3.481 |  |  |
| -2.594955531865299 | -0.52 | 1.349 | -3.5 |  |  |
| -2.588672346558119 | -0.525 | 1.36 | -3.519 |  |  |
| -2.58238916125094 | -0.531 | 1.37 | -3.538 |  |  |
| -2.57610597594376 | -0.536 | 1.38 | -3.556 |  |  |
| -2.56982279063658 | -0.541 | 1.391 | -3.574 |  |  |
| -2.563539605329401 | -0.546 | 1.401 | -3.591 |  |  |
| -2.557256420022221 | -0.552 | 1.411 | -3.608 |  |  |
| -2.550973234715042 | -0.557 | 1.421 | -3.624 |  |  |
| -2.544690049407862 | -0.562 | 1.43 | -3.64 |  |  |
| -2.538406864100682 | -0.567 | 1.44 | -3.655 |  |  |
| -2.532123678793503 | -0.572 | 1.449 | -3.67 |  |  |
| -2.525840493486323 | -0.578 | 1.459 | -3.685 |  |  |
| -2.519557308179143 | -0.583 | 1.468 | -3.699 |  |  |
| -2.513274122871964 | -0.588 | 1.477 | -3.713 |  |  |
| -2.506990937564784 | -0.593 | 1.486 | -3.726 |  |  |
| -2.500707752257604 | -0.598 | 1.495 | -3.739 |  |  |
| -2.494424566950425 | -0.603 | 1.504 | -3.752 |  |  |
| -2.488141381643245 | -0.608 | 1.513 | -3.764 |  |  |
| -2.481858196336065 | -0.613 | 1.521 | -3.775 |  |  |
| -2.475575011028886 | -0.618 | 1.53 | -3.787 |  |  |
| -2.469291825721706 | -0.623 | 1.538 | -3.797 |  |  |
| -2.463008640414527 | -0.628 | 1.546 | -3.808 |  |  |
| -2.456725455107347 | -0.633 | 1.554 | -3.818 |  |  |
| -2.450442269800167 | -0.637 | 1.562 | -3.828 |  |  |
| -2.444159084492988 | -0.642 | 1.57 | -3.837 |  |  |
| -2.437875899185808 | -0.647 | 1.577 | -3.846 |  |  |
| -2.431592713878628 | -0.652 | 1.585 | -3.854 |  |  |
| -2.425309528571449 | -0.657 | 1.592 | -3.862 |  |  |
| -2.419026343264269 | -0.661 | 1.6 | -3.87 |  |  |
| -2.412743157957089 | -0.666 | 1.607 | -3.877 |  |  |
| -2.40645997264991 | -0.671 | 1.614 | -3.884 |  |  |
| -2.40017678734273 | -0.675 | 1.621 | -3.89 |  |  |
| -2.393893602035551 | -0.68 | 1.628 | -3.897 |  |  |
| -2.387610416728371 | -0.685 | 1.634 | -3.902 |  |  |
| -2.381327231421191 | -0.689 | 1.641 | -3.908 |  |  |
| -2.375044046114012 | -0.694 | 1.647 | -3.913 |  |  |
| -2.368760860806832 | -0.698 | 1.654 | -3.917 |  |  |
| -2.362477675499652 | -0.703 | 1.66 | -3.922 |  |  |
| -2.356194490192473 | -0.707 | 1.666 | -3.926 |  |  |
| -2.349911304885293 | -0.712 | 1.672 | -3.929 |  |  |
| -2.343628119578113 | -0.716 | 1.678 | -3.932 |  |  |
| -2.337344934270934 | -0.72 | 1.684 | -3.935 |  |  |
| -2.331061748963754 | -0.725 | 1.689 | -3.938 |  |  |
| -2.324778563656574 | -0.729 | 1.695 | -3.94 |  |  |
| -2.318495378349395 | -0.733 | 1.7 | -3.942 |  |  |
| -2.312212193042215 | -0.738 | 1.705 | -3.943 |  |  |
| -2.305929007735036 | -0.742 | 1.71 | -3.944 |  |  |
| -2.299645822427856 | -0.746 | 1.715 | -3.945 |  |  |
| -2.293362637120676 | -0.75 | 1.72 | -3.945 |  |  |
| -2.287079451813496 | -0.754 | 1.725 | -3.945 |  |  |
| -2.280796266506317 | -0.758 | 1.73 | -3.945 |  |  |
| -2.274513081199137 | -0.762 | 1.734 | -3.944 |  |  |
| -2.268229895891957 | -0.766 | 1.739 | -3.944 |  |  |
| -2.261946710584778 | -0.771 | 1.743 | -3.942 |  |  |
| -2.255663525277598 | -0.775 | 1.747 | -3.941 |  |  |
| -2.249380339970419 | -0.778 | 1.751 | -3.939 |  |  |
| -2.24309715466324 | -0.782 | 1.755 | -3.937 |  |  |
| -2.23681396935606 | -0.786 | 1.759 | -3.934 |  |  |
| -2.23053078404888 | -0.79 | 1.762 | -3.931 |  |  |
| -2.2242475987417 | -0.794 | 1.766 | -3.928 |  |  |
| -2.217964413434521 | -0.798 | 1.769 | -3.925 |  |  |
| -2.211681228127341 | -0.802 | 1.773 | -3.921 |  |  |
| -2.205398042820161 | -0.805 | 1.776 | -3.917 |  |  |
| -2.199114857512981 | -0.809 | 1.779 | -3.912 |  |  |
| -2.192831672205802 | -0.813 | 1.782 | -3.908 |  |  |
| -2.186548486898622 | -0.816 | 1.785 | -3.903 |  |  |
| -2.180265301591443 | -0.82 | 1.788 | -3.898 |  |  |
| -2.173982116284263 | -0.824 | 1.79 | -3.892 |  |  |
| -2.167698930977084 | -0.827 | 1.793 | -3.886 |  |  |
| -2.161415745669904 | -0.831 | 1.795 | -3.88 |  |  |
| -2.155132560362724 | -0.834 | 1.798 | -3.874 |  |  |
| -2.148849375055545 | -0.838 | 1.8 | -3.867 |  |  |
| -2.142566189748365 | -0.841 | 1.802 | -3.86 |  |  |
| -2.136283004441185 | -0.844 | 1.804 | -3.853 |  |  |
| -2.129999819134006 | -0.848 | 1.806 | -3.846 |  |  |
| -2.123716633826826 | -0.851 | 1.807 | -3.838 |  |  |
| -2.117433448519646 | -0.854 | 1.809 | -3.83 |  |  |
| -2.111150263212467 | -0.858 | 1.81 | -3.822 |  |  |
| -2.104867077905287 | -0.861 | 1.812 | -3.813 |  |  |
| -2.098583892598107 | -0.864 | 1.813 | -3.805 |  |  |
| -2.092300707290928 | -0.867 | 1.814 | -3.796 |  |  |
| -2.086017521983748 | -0.87 | 1.815 | -3.787 |  |  |
| -2.079734336676569 | -0.873 | 1.816 | -3.777 |  |  |
| -2.073451151369389 | -0.876 | 1.817 | -3.767 |  |  |
| -2.06716796606221 | -0.879 | 1.818 | -3.757 |  |  |
| -2.06088478075503 | -0.882 | 1.818 | -3.747 |  |  |
| -2.05460159544785 | -0.885 | 1.819 | -3.737 |  |  |
| -2.04831841014067 | -0.888 | 1.819 | -3.726 |  |  |
| -2.042035224833491 | -0.891 | 1.819 | -3.715 |  |  |
| -2.035752039526311 | -0.894 | 1.82 | -3.704 |  |  |
| -2.029468854219131 | -0.897 | 1.82 | -3.693 |  |  |
| -2.023185668911951 | -0.899 | 1.82 | -3.682 |  |  |
| -2.016902483604772 | -0.902 | 1.82 | -3.67 |  |  |
| -2.010619298297592 | -0.905 | 1.819 | -3.658 |  |  |
| -2.004336112990412 | -0.907 | 1.819 | -3.646 |  |  |
| -1.998052927683233 | -0.91 | 1.818 | -3.633 |  |  |
| -1.991769742376054 | -0.913 | 1.818 | -3.621 |  |  |
| -1.985486557068874 | -0.915 | 1.817 | -3.608 |  |  |
| -1.979203371761694 | -0.918 | 1.816 | -3.595 |  |  |
| -1.972920186454515 | -0.92 | 1.816 | -3.582 |  |  |
| -1.966637001147335 | -0.923 | 1.815 | -3.569 |  |  |
| -1.960353815840155 | -0.925 | 1.813 | -3.555 |  |  |
| -1.954070630532976 | -0.927 | 1.812 | -3.541 |  |  |
| -1.947787445225796 | -0.93 | 1.811 | -3.527 |  |  |
| -1.941504259918616 | -0.932 | 1.81 | -3.513 |  |  |
| -1.935221074611437 | -0.934 | 1.808 | -3.499 |  |  |
| -1.928937889304257 | -0.937 | 1.807 | -3.485 |  |  |
| -1.922654703997078 | -0.939 | 1.805 | -3.47 |  |  |
| -1.916371518689898 | -0.941 | 1.803 | -3.455 |  |  |
| -1.910088333382718 | -0.943 | 1.801 | -3.44 |  |  |
| -1.903805148075539 | -0.945 | 1.799 | -3.425 |  |  |
| -1.897521962768359 | -0.947 | 1.797 | -3.41 |  |  |
| -1.891238777461179 | -0.949 | 1.795 | -3.395 |  |  |
| -1.884955592154 | -0.951 | 1.793 | -3.379 |  |  |
| -1.87867240684682 | -0.953 | 1.79 | -3.363 |  |  |
| -1.87238922153964 | -0.955 | 1.788 | -3.348 |  |  |
| -1.866106036232461 | -0.957 | 1.785 | -3.332 |  |  |
| -1.859822850925281 | -0.959 | 1.783 | -3.315 |  |  |
| -1.853539665618102 | -0.96 | 1.78 | -3.299 |  |  |
| -1.847256480310922 | -0.962 | 1.777 | -3.283 |  |  |
| -1.840973295003742 | -0.964 | 1.774 | -3.266 |  |  |
| -1.834690109696563 | -0.965 | 1.771 | -3.25 |  |  |
| -1.828406924389383 | -0.967 | 1.768 | -3.233 |  |  |
| -1.822123739082203 | -0.969 | 1.765 | -3.216 |  |  |
| -1.815840553775024 | -0.97 | 1.762 | -3.199 |  |  |
| -1.809557368467844 | -0.972 | 1.758 | -3.182 |  |  |
| -1.803274183160664 | -0.973 | 1.755 | -3.164 |  |  |
| -1.796990997853485 | -0.975 | 1.751 | -3.147 |  |  |
| -1.790707812546305 | -0.976 | 1.748 | -3.129 |  |  |
| -1.784424627239125 | -0.977 | 1.744 | -3.112 |  |  |
| -1.778141441931946 | -0.979 | 1.74 | -3.094 |  |  |
| -1.771858256624766 | -0.98 | 1.736 | -3.076 |  |  |
| -1.765575071317587 | -0.981 | 1.732 | -3.058 |  |  |
| -1.759291886010407 | -0.982 | 1.728 | -3.04 |  |  |
| -1.753008700703227 | -0.983 | 1.724 | -3.022 |  |  |
| -1.746725515396048 | -0.985 | 1.72 | -3.004 |  |  |
| -1.740442330088868 | -0.986 | 1.715 | -2.986 |  |  |
| -1.734159144781688 | -0.987 | 1.711 | -2.967 |  |  |
| -1.727875959474509 | -0.988 | 1.707 | -2.949 |  |  |
| -1.72159277416733 | -0.989 | 1.702 | -2.93 |  |  |
| -1.715309588860149 | -0.99 | 1.697 | -2.912 |  |  |
| -1.70902640355297 | -0.99 | 1.693 | -2.893 |  |  |
| -1.70274321824579 | -0.991 | 1.688 | -2.874 |  |  |
| -1.69646003293861 | -0.992 | 1.683 | -2.855 |  |  |
| -1.690176847631431 | -0.993 | 1.678 | -2.836 |  |  |
| -1.683893662324251 | -0.994 | 1.673 | -2.817 |  |  |
| -1.677610477017072 | -0.994 | 1.668 | -2.798 |  |  |
| -1.671327291709892 | -0.995 | 1.663 | -2.779 |  |  |
| -1.665044106402712 | -0.996 | 1.658 | -2.76 |  |  |
| -1.658760921095533 | -0.996 | 1.652 | -2.741 |  |  |
| -1.652477735788353 | -0.997 | 1.647 | -2.722 |  |  |
| -1.646194550481173 | -0.997 | 1.642 | -2.702 |  |  |
| -1.639911365173994 | -0.998 | 1.636 | -2.683 |  |  |
| -1.633628179866814 | -0.998 | 1.63 | -2.663 |  |  |
| -1.627344994559634 | -0.998 | 1.625 | -2.644 |  |  |
| -1.621061809252455 | -0.999 | 1.619 | -2.625 |  |  |
| -1.614778623945275 | -0.999 | 1.613 | -2.605 |  |  |
| -1.608495438638096 | -0.999 | 1.607 | -2.585 |  |  |
| -1.602212253330916 | -1 | 1.601 | -2.566 |  |  |
| -1.595929068023736 | -1 | 1.595 | -2.546 |  |  |
| -1.589645882716557 | -1 | 1.589 | -2.527 |  |  |
| -1.583362697409377 | -1 | 1.583 | -2.507 |  |  |
| -1.577079512102197 | -1 | 1.577 | -2.487 |  |  |
| -1.570796326795018 | -1 | 1.571 | -2.467 |  |  |
| -1.564513141487838 | -1 | 1.564 | -2.448 |  |  |
| -1.558229956180659 | -1 | 1.558 | -2.428 |  |  |
| -1.551946770873479 | -1 | 1.552 | -2.408 |  |  |
| -1.545663585566299 | -1 | 1.545 | -2.388 |  |  |
| -1.53938040025912 | -1 | 1.539 | -2.369 |  |  |
| -1.53309721495194 | -0.999 | 1.532 | -2.349 |  |  |
| -1.52681402964476 | -0.999 | 1.525 | -2.329 |  |  |
| -1.520530844337581 | -0.999 | 1.519 | -2.309 |  |  |
| -1.514247659030401 | -0.998 | 1.512 | -2.289 |  |  |
| -1.507964473723221 | -0.998 | 1.505 | -2.269 |  |  |
| -1.501681288416042 | -0.998 | 1.498 | -2.25 |  |  |
| -1.495398103108862 | -0.997 | 1.491 | -2.23 |  |  |
| -1.489114917801682 | -0.997 | 1.484 | -2.21 |  |  |
| -1.482831732494503 | -0.996 | 1.477 | -2.19 |  |  |
| -1.476548547187323 | -0.996 | 1.47 | -2.171 |  |  |
| -1.470265361880144 | -0.995 | 1.463 | -2.151 |  |  |
| -1.463982176572964 | -0.994 | 1.456 | -2.131 |  |  |
| -1.457698991265784 | -0.994 | 1.448 | -2.111 |  |  |
| -1.451415805958605 | -0.993 | 1.441 | -2.092 |  |  |
| -1.445132620651425 | -0.992 | 1.434 | -2.072 |  |  |
| -1.438849435344245 | -0.991 | 1.426 | -2.052 |  |  |
| -1.432566250037066 | -0.99 | 1.419 | -2.033 |  |  |
| -1.426283064729886 | -0.99 | 1.411 | -2.013 |  |  |
| -1.419999879422706 | -0.989 | 1.404 | -1.994 |  |  |
| -1.413716694115527 | -0.988 | 1.396 | -1.974 |  |  |
| -1.407433508808347 | -0.987 | 1.389 | -1.954 |  |  |
| -1.401150323501168 | -0.986 | 1.381 | -1.935 |  |  |
| -1.394867138193988 | -0.985 | 1.373 | -1.916 |  |  |
| -1.388583952886808 | -0.983 | 1.366 | -1.896 |  |  |
| -1.382300767579629 | -0.982 | 1.358 | -1.877 |  |  |
| -1.376017582272449 | -0.981 | 1.35 | -1.858 |  |  |
| -1.369734396965269 | -0.98 | 1.342 | -1.838 |  |  |
| -1.36345121165809 | -0.979 | 1.334 | -1.819 |  |  |
| -1.35716802635091 | -0.977 | 1.326 | -1.8 |  |  |
| -1.35088484104373 | -0.976 | 1.318 | -1.781 |  |  |
| -1.344601655736551 | -0.975 | 1.31 | -1.762 |  |  |
| -1.338318470429371 | -0.973 | 1.302 | -1.743 |  |  |
| -1.332035285122191 | -0.972 | 1.294 | -1.724 |  |  |
| -1.325752099815012 | -0.97 | 1.286 | -1.705 |  |  |
| -1.319468914507832 | -0.969 | 1.278 | -1.686 |  |  |
| -1.313185729200653 | -0.967 | 1.27 | -1.668 |  |  |
| -1.306902543893473 | -0.965 | 1.262 | -1.649 |  |  |
| -1.300619358586293 | -0.964 | 1.253 | -1.63 |  |  |
| -1.294336173279114 | -0.962 | 1.245 | -1.612 |  |  |
| -1.288052987971934 | -0.96 | 1.237 | -1.593 |  |  |
| -1.281769802664754 | -0.959 | 1.229 | -1.575 |  |  |
| -1.275486617357575 | -0.957 | 1.22 | -1.556 |  |  |
| -1.269203432050395 | -0.955 | 1.212 | -1.538 |  |  |
| -1.262920246743215 | -0.953 | 1.204 | -1.52 |  |  |
| -1.256637061436036 | -0.951 | 1.195 | -1.502 |  |  |
| -1.250353876128856 | -0.949 | 1.187 | -1.484 |  |  |
| -1.244070690821677 | -0.947 | 1.178 | -1.466 |  |  |
| -1.237787505514497 | -0.945 | 1.17 | -1.448 |  |  |
| -1.231504320207317 | -0.943 | 1.161 | -1.43 |  |  |
| -1.225221134900138 | -0.941 | 1.153 | -1.412 |  |  |
| -1.218937949592958 | -0.939 | 1.144 | -1.395 |  |  |
| -1.212654764285778 | -0.937 | 1.136 | -1.377 |  |  |
| -1.206371578978599 | -0.934 | 1.127 | -1.36 |  |  |
| -1.20008839367142 | -0.932 | 1.119 | -1.342 |  |  |
| -1.193805208364239 | -0.93 | 1.11 | -1.325 |  |  |
| -1.18752202305706 | -0.927 | 1.101 | -1.308 |  |  |
| -1.18123883774988 | -0.925 | 1.093 | -1.291 |  |  |
| -1.1749556524427 | -0.923 | 1.084 | -1.274 |  |  |
| -1.168672467135521 | -0.92 | 1.075 | -1.257 |  |  |
| -1.162389281828341 | -0.918 | 1.067 | -1.24 |  |  |
| -1.156106096521162 | -0.915 | 1.058 | -1.223 |  |  |
| -1.149822911213982 | -0.913 | 1.049 | -1.207 |  |  |
| -1.143539725906802 | -0.91 | 1.041 | -1.19 |  |  |
| -1.137256540599623 | -0.907 | 1.032 | -1.174 |  |  |
| -1.130973355292443 | -0.905 | 1.023 | -1.157 |  |  |
| -1.124690169985263 | -0.902 | 1.015 | -1.141 |  |  |
| -1.118406984678084 | -0.899 | 1.006 | -1.125 |  |  |
| -1.112123799370904 | -0.897 | 0.997 | -1.109 |  |  |
| -1.105840614063724 | -0.894 | 0.988 | -1.093 |  |  |
| -1.099557428756545 | -0.891 | 0.98 | -1.077 |  |  |
| -1.093274243449365 | -0.888 | 0.971 | -1.062 |  |  |
| -1.086991058142186 | -0.885 | 0.962 | -1.046 |  |  |
| -1.080707872835006 | -0.882 | 0.953 | -1.03 |  |  |
| -1.074424687527826 | -0.879 | 0.945 | -1.015 |  |  |
| -1.068141502220647 | -0.876 | 0.936 | -1 |  |  |
| -1.061858316913467 | -0.873 | 0.927 | -0.985 |  |  |
| -1.055575131606287 | -0.87 | 0.919 | -0.97 |  |  |
| -1.049291946299108 | -0.867 | 0.91 | -0.955 |  |  |
| -1.043008760991928 | -0.864 | 0.901 | -0.94 |  |  |
| -1.036725575684748 | -0.861 | 0.892 | -0.925 |  |  |
| -1.030442390377569 | -0.858 | 0.884 | -0.911 |  |  |
| -1.024159205070389 | -0.854 | 0.875 | -0.896 |  |  |
| -1.01787601976321 | -0.851 | 0.866 | -0.882 |  |  |
| -1.01159283445603 | -0.848 | 0.858 | -0.867 |  |  |
| -1.00530964914885 | -0.844 | 0.849 | -0.853 |  |  |
| -0.999026463841671 | -0.841 | 0.84 | -0.839 |  |  |
| -0.992743278534491 | -0.838 | 0.831 | -0.825 |  |  |
| -0.986460093227311 | -0.834 | 0.823 | -0.812 |  |  |
| -0.980176907920132 | -0.831 | 0.814 | -0.798 |  |  |
| -0.973893722612952 | -0.827 | 0.805 | -0.784 |  |  |
| -0.967610537305772 | -0.824 | 0.797 | -0.771 |  |  |
| -0.961327351998593 | -0.82 | 0.788 | -0.758 |  |  |
| -0.955044166691413 | -0.816 | 0.78 | -0.745 |  |  |
| -0.948760981384233 | -0.813 | 0.771 | -0.732 |  |  |
| -0.942477796077054 | -0.809 | 0.762 | -0.719 |  |  |
| -0.936194610769874 | -0.805 | 0.754 | -0.706 |  |  |
| -0.929911425462695 | -0.802 | 0.745 | -0.693 |  |  |
| -0.923628240155515 | -0.798 | 0.737 | -0.681 |  |  |
| -0.917345054848335 | -0.794 | 0.728 | -0.668 |  |  |
| -0.911061869541156 | -0.79 | 0.72 | -0.656 |  |  |
| -0.904778684233976 | -0.786 | 0.711 | -0.644 |  |  |
| -0.898495498926796 | -0.782 | 0.703 | -0.632 |  |  |
| -0.892212313619617 | -0.778 | 0.695 | -0.62 |  |  |
| -0.885929128312437 | -0.775 | 0.686 | -0.608 |  |  |
| -0.879645943005257 | -0.771 | 0.678 | -0.596 |  |  |
| -0.873362757698078 | -0.766 | 0.669 | -0.585 |  |  |
| -0.867079572390898 | -0.762 | 0.661 | -0.573 |  |  |
| -0.860796387083718 | -0.758 | 0.653 | -0.562 |  |  |
| -0.854513201776539 | -0.754 | 0.645 | -0.551 |  |  |
| -0.848230016469359 | -0.75 | 0.636 | -0.54 |  |  |
| -0.84194683116218 | -0.746 | 0.628 | -0.529 |  |  |
| -0.835663645855 | -0.742 | 0.62 | -0.518 |  |  |
| -0.82938046054782 | -0.738 | 0.612 | -0.507 |  |  |
| -0.823097275240641 | -0.733 | 0.604 | -0.497 |  |  |
| -0.816814089933461 | -0.729 | 0.595 | -0.486 |  |  |
| -0.810530904626281 | -0.725 | 0.587 | -0.476 |  |  |
| -0.804247719319102 | -0.72 | 0.579 | -0.466 |  |  |
| -0.797964534011922 | -0.716 | 0.571 | -0.456 |  |  |
| -0.791681348704742 | -0.712 | 0.563 | -0.446 |  |  |
| -0.785398163397563 | -0.707 | 0.555 | -0.436 |  |  |
| -0.779114978090383 | -0.703 | 0.547 | -0.427 |  |  |
| -0.772831792783204 | -0.698 | 0.54 | -0.417 |  |  |
| -0.766548607476024 | -0.694 | 0.532 | -0.408 |  |  |
| -0.760265422168844 | -0.689 | 0.524 | -0.398 |  |  |
| -0.753982236861665 | -0.685 | 0.516 | -0.389 |  |  |
| -0.747699051554485 | -0.68 | 0.508 | -0.38 |  |  |
| -0.741415866247305 | -0.675 | 0.501 | -0.371 |  |  |
| -0.735132680940126 | -0.671 | 0.493 | -0.362 |  |  |
| -0.728849495632946 | -0.666 | 0.485 | -0.354 |  |  |
| -0.722566310325766 | -0.661 | 0.478 | -0.345 |  |  |
| -0.716283125018587 | -0.657 | 0.47 | -0.337 |  |  |
| -0.709999939711407 | -0.652 | 0.463 | -0.329 |  |  |
| -0.703716754404227 | -0.647 | 0.455 | -0.32 |  |  |
| -0.697433569097048 | -0.642 | 0.448 | -0.312 |  |  |
| -0.691150383789868 | -0.637 | 0.441 | -0.304 |  |  |
| -0.684867198482689 | -0.633 | 0.433 | -0.297 |  |  |
| -0.678584013175509 | -0.628 | 0.426 | -0.289 |  |  |
| -0.672300827868329 | -0.623 | 0.419 | -0.281 |  |  |
| -0.66601764256115 | -0.618 | 0.412 | -0.274 |  |  |
| -0.65973445725397 | -0.613 | 0.404 | -0.267 |  |  |
| -0.65345127194679 | -0.608 | 0.397 | -0.26 |  |  |
| -0.647168086639611 | -0.603 | 0.39 | -0.253 |  |  |
| -0.640884901332431 | -0.598 | 0.383 | -0.246 |  |  |
| -0.634601716025251 | -0.593 | 0.376 | -0.239 |  |  |
| -0.628318530718072 | -0.588 | 0.369 | -0.232 |  |  |
| -0.622035345410892 | -0.583 | 0.362 | -0.225 |  |  |
| -0.615752160103712 | -0.578 | 0.356 | -0.219 |  |  |
| -0.609468974796533 | -0.572 | 0.349 | -0.213 |  |  |
| -0.603185789489353 | -0.567 | 0.342 | -0.206 |  |  |
| -0.596902604182174 | -0.562 | 0.336 | -0.2 |  |  |
| -0.590619418874994 | -0.557 | 0.329 | -0.194 |  |  |
| -0.584336233567814 | -0.552 | 0.322 | -0.188 |  |  |
| -0.578053048260635 | -0.546 | 0.316 | -0.183 |  |  |
| -0.571769862953455 | -0.541 | 0.309 | -0.177 |  |  |
| -0.565486677646275 | -0.536 | 0.303 | -0.171 |  |  |
| -0.559203492339096 | -0.531 | 0.297 | -0.166 |  |  |
| -0.552920307031916 | -0.525 | 0.29 | -0.161 |  |  |
| -0.546637121724737 | -0.52 | 0.284 | -0.155 |  |  |
| -0.540353936417557 | -0.514 | 0.278 | -0.15 |  |  |
| -0.534070751110377 | -0.509 | 0.272 | -0.145 |  |  |
| -0.527787565803198 | -0.504 | 0.266 | -0.14 |  |  |
| -0.521504380496018 | -0.498 | 0.26 | -0.135 |  |  |
| -0.515221195188838 | -0.493 | 0.254 | -0.131 |  |  |
| -0.508938009881659 | -0.487 | 0.248 | -0.126 |  |  |
| -0.502654824574479 | -0.482 | 0.242 | -0.122 |  |  |
| -0.496371639267299 | -0.476 | 0.236 | -0.117 |  |  |
| -0.49008845396012 | -0.471 | 0.231 | -0.113 |  |  |
| -0.48380526865294 | -0.465 | 0.225 | -0.109 |  |  |
| -0.477522083345761 | -0.46 | 0.219 | -0.105 |  |  |
| -0.471238898038581 | -0.454 | 0.214 | -0.101 |  |  |
| -0.464955712731402 | -0.448 | 0.208 | -0.097 |  |  |
| -0.458672527424222 | -0.443 | 0.203 | -0.093 |  |  |
| -0.452389342117042 | -0.437 | 0.198 | -0.089 |  |  |
| -0.446106156809863 | -0.431 | 0.192 | -0.086 |  |  |
| -0.439822971502683 | -0.426 | 0.187 | -0.082 |  |  |
| -0.433539786195504 | -0.42 | 0.182 | -0.079 |  |  |
| -0.427256600888324 | -0.414 | 0.177 | -0.076 |  |  |
| -0.420973415581144 | -0.409 | 0.172 | -0.072 |  |  |
| -0.414690230273965 | -0.403 | 0.167 | -0.069 |  |  |
| -0.408407044966785 | -0.397 | 0.162 | -0.066 |  |  |
| -0.402123859659606 | -0.391 | 0.157 | -0.063 |  |  |
| -0.395840674352426 | -0.386 | 0.153 | -0.06 |  |  |
| -0.389557489045247 | -0.38 | 0.148 | -0.058 |  |  |
| -0.383274303738067 | -0.374 | 0.143 | -0.055 |  |  |
| -0.376991118430887 | -0.368 | 0.139 | -0.052 |  |  |
| -0.370707933123708 | -0.362 | 0.134 | -0.05 |  |  |
| -0.364424747816528 | -0.356 | 0.13 | -0.047 |  |  |
| -0.358141562509349 | -0.351 | 0.126 | -0.045 |  |  |
| -0.351858377202169 | -0.345 | 0.121 | -0.043 |  |  |
| -0.345575191894989 | -0.339 | 0.117 | -0.04 |  |  |
| -0.33929200658781 | -0.333 | 0.113 | -0.038 |  |  |
| -0.33300882128063 | -0.327 | 0.109 | -0.036 |  |  |
| -0.326725635973451 | -0.321 | 0.105 | -0.034 |  |  |
| -0.320442450666271 | -0.315 | 0.101 | -0.032 |  |  |
| -0.314159265359092 | -0.309 | 0.097 | -0.03 |  |  |
| -0.307876080051912 | -0.303 | 0.093 | -0.029 |  |  |
| -0.301592894744732 | -0.297 | 0.09 | -0.027 |  |  |
| -0.295309709437553 | -0.291 | 0.086 | -0.025 |  |  |
| -0.289026524130373 | -0.285 | 0.082 | -0.024 |  |  |
| -0.282743338823194 | -0.279 | 0.079 | -0.022 |  |  |
| -0.276460153516014 | -0.273 | 0.075 | -0.021 |  |  |
| -0.270176968208834 | -0.267 | 0.072 | -0.019 |  |  |
| -0.263893782901655 | -0.261 | 0.069 | -0.018 |  |  |
| -0.257610597594475 | -0.255 | 0.066 | -0.017 |  |  |
| -0.251327412287296 | -0.249 | 0.063 | -0.016 |  |  |
| -0.245044226980116 | -0.243 | 0.059 | -0.015 |  |  |
| -0.238761041672937 | -0.236 | 0.056 | -0.013 |  |  |
| -0.232477856365757 | -0.23 | 0.054 | -0.012 |  |  |
| -0.226194671058577 | -0.224 | 0.051 | -0.011 |  |  |
| -0.219911485751398 | -0.218 | 0.048 | -0.011 |  |  |
| -0.213628300444218 | -0.212 | 0.045 | -0.01 |  |  |
| -0.207345115137039 | -0.206 | 0.043 | -0.009 |  |  |
| -0.201061929829859 | -0.2 | 0.04 | -0.008 |  |  |
| -0.194778744522679 | -0.194 | 0.038 | -0.007 |  |  |
| -0.1884955592155 | -0.187 | 0.035 | -0.007 |  |  |
| -0.18221237390832 | -0.181 | 0.033 | -0.006 |  |  |
| -0.175929188601141 | -0.175 | 0.031 | -0.005 |  |  |
| -0.169646003293961 | -0.169 | 0.029 | -0.005 |  |  |
| -0.163362817986782 | -0.163 | 0.027 | -0.004 |  |  |
| -0.157079632679602 | -0.156 | 0.025 | -0.004 |  |  |
| -0.150796447372422 | -0.15 | 0.023 | -0.003 |  |  |
| -0.144513262065243 | -0.144 | 0.021 | -0.003 |  |  |
| -0.138230076758063 | -0.138 | 0.019 | -0.003 |  |  |
| -0.131946891450884 | -0.132 | 0.017 | -0.002 |  |  |
| -0.125663706143704 | -0.125 | 0.016 | -0.002 |  |  |
| -0.119380520836524 | -0.119 | 0.014 | -0.002 |  |  |
| -0.113097335529345 | -0.113 | 0.013 | -0.001 |  |  |
| -0.106814150222165 | -0.107 | 0.011 | -0.001 |  |  |
| -0.100530964914986 | -0.1 | 0.01 | -0.001 |  |  |
| -0.0942477796078061 | -0.094 | 0.009 | -0.001 |  |  |
| -0.0879645943006265 | -0.088 | 0.008 | -0.001 |  |  |
| -0.0816814089934469 | -0.082 | 0.007 | -0.001 |  |  |
| -0.0753982236862674 | -0.075 | 0.006 | 0 |  |  |
| -0.0691150383790878 | -0.069 | 0.005 | 0 |  |  |
| -0.0628318530719082 | -0.063 | 0.004 | 0 |  |  |
| -0.0565486677647286 | -0.057 | 0.003 | 0 |  |  |
| -0.050265482457549 | -0.05 | 0.003 | 0 |  |  |
| -0.0439822971503694 | -0.044 | 0.002 | 0 |  |  |
| -0.0376991118431899 | -0.038 | 0.001 | 0 |  |  |
| -0.0314159265360103 | -0.031 | 0.001 | 0 |  |  |
| -0.0251327412288307 | -0.025 | 0.001 | 0 |  |  |
| -0.0188495559216511 | -0.019 | 0 | 0 |  |  |
| -0.0125663706144715 | -0.013 | 0 | 0 |  |  |
| -0.00628318530729192 | -0.006 | 0 | 0 |  |  |
| -1.12338957580782e-13 | 0 | 0 | 0 |  |  |
| 0.00628318530706725 | 0.006 | 0 | 0 |  |  |
| 0.0125663706142468 | 0.013 | 0 | 0 |  |  |
| 0.0188495559214264 | 0.019 | 0 | 0 |  |  |
| 0.025132741228606 | 0.025 | 0.001 | 0 |  |  |
| 0.0314159265357856 | 0.031 | 0.001 | 0 |  |  |
| 0.0376991118429652 | 0.038 | 0.001 | 0 |  |  |
| 0.0439822971501448 | 0.044 | 0.002 | 0 |  |  |
| 0.0502654824573243 | 0.05 | 0.003 | 0 |  |  |
| 0.0565486677645039 | 0.057 | 0.003 | 0 |  |  |
| 0.0628318530716835 | 0.063 | 0.004 | 0 |  |  |
| 0.0691150383788631 | 0.069 | 0.005 | 0 |  |  |
| 0.0753982236860427 | 0.075 | 0.006 | 0 |  |  |
| 0.0816814089932222 | 0.082 | 0.007 | 0.001 |  |  |
| 0.0879645943004018 | 0.088 | 0.008 | 0.001 |  |  |
| 0.0942477796075814 | 0.094 | 0.009 | 0.001 |  |  |
| 0.100530964914761 | 0.1 | 0.01 | 0.001 |  |  |
| 0.106814150221941 | 0.107 | 0.011 | 0.001 |  |  |
| 0.11309733552912 | 0.113 | 0.013 | 0.001 |  |  |
| 0.1193805208363 | 0.119 | 0.014 | 0.002 |  |  |
| 0.125663706143479 | 0.125 | 0.016 | 0.002 |  |  |
| 0.131946891450659 | 0.132 | 0.017 | 0.002 |  |  |
| 0.138230076757839 | 0.138 | 0.019 | 0.003 |  |  |
| 0.144513262065018 | 0.144 | 0.021 | 0.003 |  |  |
| 0.150796447372198 | 0.15 | 0.023 | 0.003 |  |  |
| 0.157079632679377 | 0.156 | 0.025 | 0.004 |  |  |
| 0.163362817986557 | 0.163 | 0.027 | 0.004 |  |  |
| 0.169646003293736 | 0.169 | 0.029 | 0.005 |  |  |
| 0.175929188600916 | 0.175 | 0.031 | 0.005 |  |  |
| 0.182212373908096 | 0.181 | 0.033 | 0.006 |  |  |
| 0.188495559215275 | 0.187 | 0.035 | 0.007 |  |  |
| 0.194778744522455 | 0.194 | 0.038 | 0.007 |  |  |
| 0.201061929829634 | 0.2 | 0.04 | 0.008 |  |  |
| 0.207345115136814 | 0.206 | 0.043 | 0.009 |  |  |
| 0.213628300443994 | 0.212 | 0.045 | 0.01 |  |  |
| 0.219911485751173 | 0.218 | 0.048 | 0.011 |  |  |
| 0.226194671058353 | 0.224 | 0.051 | 0.011 |  |  |
| 0.232477856365532 | 0.23 | 0.054 | 0.012 |  |  |
| 0.238761041672712 | 0.236 | 0.056 | 0.013 |  |  |
| 0.245044226979891 | 0.243 | 0.059 | 0.015 |  |  |
| 0.251327412287071 | 0.249 | 0.063 | 0.016 |  |  |
| 0.257610597594251 | 0.255 | 0.066 | 0.017 |  |  |
| 0.26389378290143 | 0.261 | 0.069 | 0.018 |  |  |
| 0.27017696820861 | 0.267 | 0.072 | 0.019 |  |  |
| 0.276460153515789 | 0.273 | 0.075 | 0.021 |  |  |
| 0.282743338822969 | 0.279 | 0.079 | 0.022 |  |  |
| 0.289026524130149 | 0.285 | 0.082 | 0.024 |  |  |
| 0.295309709437328 | 0.291 | 0.086 | 0.025 |  |  |
| 0.301592894744508 | 0.297 | 0.09 | 0.027 |  |  |
| 0.307876080051687 | 0.303 | 0.093 | 0.029 |  |  |
| 0.314159265358867 | 0.309 | 0.097 | 0.03 |  |  |
| 0.320442450666046 | 0.315 | 0.101 | 0.032 |  |  |
| 0.326725635973226 | 0.321 | 0.105 | 0.034 |  |  |
| 0.333008821280406 | 0.327 | 0.109 | 0.036 |  |  |
| 0.339292006587585 | 0.333 | 0.113 | 0.038 |  |  |
| 0.345575191894765 | 0.339 | 0.117 | 0.04 |  |  |
| 0.351858377201944 | 0.345 | 0.121 | 0.043 |  |  |
| 0.358141562509124 | 0.351 | 0.126 | 0.045 |  |  |
| 0.364424747816304 | 0.356 | 0.13 | 0.047 |  |  |
| 0.370707933123483 | 0.362 | 0.134 | 0.05 |  |  |
| 0.376991118430663 | 0.368 | 0.139 | 0.052 |  |  |
| 0.383274303737842 | 0.374 | 0.143 | 0.055 |  |  |
| 0.389557489045022 | 0.38 | 0.148 | 0.058 |  |  |
| 0.395840674352201 | 0.386 | 0.153 | 0.06 |  |  |
| 0.402123859659381 | 0.391 | 0.157 | 0.063 |  |  |
| 0.408407044966561 | 0.397 | 0.162 | 0.066 |  |  |
| 0.41469023027374 | 0.403 | 0.167 | 0.069 |  |  |
| 0.42097341558092 | 0.409 | 0.172 | 0.072 |  |  |
| 0.427256600888099 | 0.414 | 0.177 | 0.076 |  |  |
| 0.433539786195279 | 0.42 | 0.182 | 0.079 |  |  |
| 0.439822971502459 | 0.426 | 0.187 | 0.082 |  |  |
| 0.446106156809638 | 0.431 | 0.192 | 0.086 |  |  |
| 0.452389342116818 | 0.437 | 0.198 | 0.089 |  |  |
| 0.458672527423997 | 0.443 | 0.203 | 0.093 |  |  |
| 0.464955712731177 | 0.448 | 0.208 | 0.097 |  |  |
| 0.471238898038356 | 0.454 | 0.214 | 0.101 |  |  |
| 0.477522083345536 | 0.46 | 0.219 | 0.105 |  |  |
| 0.483805268652716 | 0.465 | 0.225 | 0.109 |  |  |
| 0.490088453959895 | 0.471 | 0.231 | 0.113 |  |  |
| 0.496371639267075 | 0.476 | 0.236 | 0.117 |  |  |
| 0.502654824574254 | 0.482 | 0.242 | 0.122 |  |  |
| 0.508938009881434 | 0.487 | 0.248 | 0.126 |  |  |
| 0.515221195188614 | 0.493 | 0.254 | 0.131 |  |  |
| 0.521504380495793 | 0.498 | 0.26 | 0.135 |  |  |
| 0.527787565802973 | 0.504 | 0.266 | 0.14 |  |  |
| 0.534070751110153 | 0.509 | 0.272 | 0.145 |  |  |
| 0.540353936417332 | 0.514 | 0.278 | 0.15 |  |  |
| 0.546637121724512 | 0.52 | 0.284 | 0.155 |  |  |
| 0.552920307031692 | 0.525 | 0.29 | 0.161 |  |  |
| 0.559203492338871 | 0.531 | 0.297 | 0.166 |  |  |
| 0.565486677646051 | 0.536 | 0.303 | 0.171 |  |  |
| 0.571769862953231 | 0.541 | 0.309 | 0.177 |  |  |
| 0.57805304826041 | 0.546 | 0.316 | 0.183 |  |  |
| 0.58433623356759 | 0.552 | 0.322 | 0.188 |  |  |
| 0.590619418874769 | 0.557 | 0.329 | 0.194 |  |  |
| 0.596902604181949 | 0.562 | 0.336 | 0.2 |  |  |
| 0.603185789489129 | 0.567 | 0.342 | 0.206 |  |  |
| 0.609468974796308 | 0.572 | 0.349 | 0.213 |  |  |
| 0.615752160103488 | 0.578 | 0.356 | 0.219 |  |  |
| 0.622035345410668 | 0.583 | 0.362 | 0.225 |  |  |
| 0.628318530717847 | 0.588 | 0.369 | 0.232 |  |  |
| 0.634601716025027 | 0.593 | 0.376 | 0.239 |  |  |
| 0.640884901332206 | 0.598 | 0.383 | 0.246 |  |  |
| 0.647168086639386 | 0.603 | 0.39 | 0.253 |  |  |
| 0.653451271946566 | 0.608 | 0.397 | 0.26 |  |  |
| 0.659734457253745 | 0.613 | 0.404 | 0.267 |  |  |
| 0.666017642560925 | 0.618 | 0.412 | 0.274 |  |  |
| 0.672300827868105 | 0.623 | 0.419 | 0.281 |  |  |
| 0.678584013175284 | 0.628 | 0.426 | 0.289 |  |  |
| 0.684867198482464 | 0.633 | 0.433 | 0.297 |  |  |
| 0.691150383789644 | 0.637 | 0.441 | 0.304 |  |  |
| 0.697433569096823 | 0.642 | 0.448 | 0.312 |  |  |
| 0.703716754404003 | 0.647 | 0.455 | 0.32 |  |  |
| 0.709999939711183 | 0.652 | 0.463 | 0.329 |  |  |
| 0.716283125018362 | 0.657 | 0.47 | 0.337 |  |  |
| 0.722566310325542 | 0.661 | 0.478 | 0.345 |  |  |
| 0.728849495632721 | 0.666 | 0.485 | 0.354 |  |  |
| 0.735132680939901 | 0.671 | 0.493 | 0.362 |  |  |
| 0.741415866247081 | 0.675 | 0.501 | 0.371 |  |  |
| 0.74769905155426 | 0.68 | 0.508 | 0.38 |  |  |
| 0.75398223686144 | 0.685 | 0.516 | 0.389 |  |  |
| 0.76026542216862 | 0.689 | 0.524 | 0.398 |  |  |
| 0.766548607475799 | 0.694 | 0.532 | 0.408 |  |  |
| 0.772831792782979 | 0.698 | 0.54 | 0.417 |  |  |
| 0.779114978090159 | 0.703 | 0.547 | 0.427 |  |  |
| 0.785398163397338 | 0.707 | 0.555 | 0.436 |  |  |
| 0.791681348704518 | 0.712 | 0.563 | 0.446 |  |  |
| 0.797964534011697 | 0.716 | 0.571 | 0.456 |  |  |
| 0.804247719318877 | 0.72 | 0.579 | 0.466 |  |  |
| 0.810530904626057 | 0.725 | 0.587 | 0.476 |  |  |
| 0.816814089933236 | 0.729 | 0.595 | 0.486 |  |  |
| 0.823097275240416 | 0.733 | 0.604 | 0.497 |  |  |
| 0.829380460547596 | 0.738 | 0.612 | 0.507 |  |  |
| 0.835663645854775 | 0.742 | 0.62 | 0.518 |  |  |
| 0.841946831161955 | 0.746 | 0.628 | 0.529 |  |  |
| 0.848230016469135 | 0.75 | 0.636 | 0.54 |  |  |
| 0.854513201776314 | 0.754 | 0.645 | 0.551 |  |  |
| 0.860796387083494 | 0.758 | 0.653 | 0.562 |  |  |
| 0.867079572390674 | 0.762 | 0.661 | 0.573 |  |  |
| 0.873362757697853 | 0.766 | 0.669 | 0.585 |  |  |
| 0.879645943005033 | 0.771 | 0.678 | 0.596 |  |  |
| 0.885929128312212 | 0.775 | 0.686 | 0.608 |  |  |
| 0.892212313619392 | 0.778 | 0.695 | 0.62 |  |  |
| 0.898495498926572 | 0.782 | 0.703 | 0.632 |  |  |
| 0.904778684233751 | 0.786 | 0.711 | 0.644 |  |  |
| 0.911061869540931 | 0.79 | 0.72 | 0.656 |  |  |
| 0.917345054848111 | 0.794 | 0.728 | 0.668 |  |  |
| 0.92362824015529 | 0.798 | 0.737 | 0.681 |  |  |
| 0.92991142546247 | 0.802 | 0.745 | 0.693 |  |  |
| 0.93619461076965 | 0.805 | 0.754 | 0.706 |  |  |
| 0.942477796076829 | 0.809 | 0.762 | 0.719 |  |  |
| 0.948760981384009 | 0.813 | 0.771 | 0.732 |  |  |
| 0.955044166691188 | 0.816 | 0.78 | 0.745 |  |  |
| 0.961327351998368 | 0.82 | 0.788 | 0.758 |  |  |
| 0.967610537305548 | 0.824 | 0.797 | 0.771 |  |  |
| 0.973893722612727 | 0.827 | 0.805 | 0.784 |  |  |
| 0.980176907919907 | 0.831 | 0.814 | 0.798 |  |  |
| 0.986460093227087 | 0.834 | 0.823 | 0.812 |  |  |
| 0.992743278534266 | 0.838 | 0.831 | 0.825 |  |  |
| 0.999026463841446 | 0.841 | 0.84 | 0.839 |  |  |
| 1.005309649148626 | 0.844 | 0.849 | 0.853 |  |  |
| 1.011592834455805 | 0.848 | 0.858 | 0.867 |  |  |
| 1.017876019762985 | 0.851 | 0.866 | 0.882 |  |  |
| 1.024159205070164 | 0.854 | 0.875 | 0.896 |  |  |
| 1.030442390377344 | 0.858 | 0.884 | 0.911 |  |  |
| 1.036725575684524 | 0.861 | 0.892 | 0.925 |  |  |
| 1.043008760991703 | 0.864 | 0.901 | 0.94 |  |  |
| 1.049291946298883 | 0.867 | 0.91 | 0.955 |  |  |
| 1.055575131606063 | 0.87 | 0.919 | 0.97 |  |  |
| 1.061858316913242 | 0.873 | 0.927 | 0.985 |  |  |
| 1.068141502220422 | 0.876 | 0.936 | 1 |  |  |
| 1.074424687527602 | 0.879 | 0.945 | 1.015 |  |  |
| 1.080707872834781 | 0.882 | 0.953 | 1.03 |  |  |
| 1.086991058141961 | 0.885 | 0.962 | 1.046 |  |  |
| 1.09327424344914 | 0.888 | 0.971 | 1.062 |  |  |
| 1.09955742875632 | 0.891 | 0.98 | 1.077 |  |  |
| 1.1058406140635 | 0.894 | 0.988 | 1.093 |  |  |
| 1.112123799370679 | 0.897 | 0.997 | 1.109 |  |  |
| 1.11840698467786 | 0.899 | 1.006 | 1.125 |  |  |
| 1.124690169985039 | 0.902 | 1.015 | 1.141 |  |  |
| 1.130973355292218 | 0.905 | 1.023 | 1.157 |  |  |
| 1.137256540599398 | 0.907 | 1.032 | 1.174 |  |  |
| 1.143539725906578 | 0.91 | 1.041 | 1.19 |  |  |
| 1.149822911213757 | 0.913 | 1.049 | 1.207 |  |  |
| 1.156106096520937 | 0.915 | 1.058 | 1.223 |  |  |
| 1.162389281828116 | 0.918 | 1.067 | 1.24 |  |  |
| 1.168672467135296 | 0.92 | 1.075 | 1.257 |  |  |
| 1.174955652442476 | 0.923 | 1.084 | 1.274 |  |  |
| 1.181238837749655 | 0.925 | 1.093 | 1.291 |  |  |
| 1.187522023056835 | 0.927 | 1.101 | 1.308 |  |  |
| 1.193805208364015 | 0.93 | 1.11 | 1.325 |  |  |
| 1.200088393671194 | 0.932 | 1.119 | 1.342 |  |  |
| 1.206371578978374 | 0.934 | 1.127 | 1.36 |  |  |
| 1.212654764285554 | 0.937 | 1.136 | 1.377 |  |  |
| 1.218937949592733 | 0.939 | 1.144 | 1.395 |  |  |
| 1.225221134899913 | 0.941 | 1.153 | 1.412 |  |  |
| 1.231504320207093 | 0.943 | 1.161 | 1.43 |  |  |
| 1.237787505514272 | 0.945 | 1.17 | 1.448 |  |  |
| 1.244070690821452 | 0.947 | 1.178 | 1.466 |  |  |
| 1.250353876128631 | 0.949 | 1.187 | 1.484 |  |  |
| 1.256637061435811 | 0.951 | 1.195 | 1.502 |  |  |
| 1.262920246742991 | 0.953 | 1.204 | 1.52 |  |  |
| 1.26920343205017 | 0.955 | 1.212 | 1.538 |  |  |
| 1.27548661735735 | 0.957 | 1.22 | 1.556 |  |  |
| 1.28176980266453 | 0.959 | 1.229 | 1.575 |  |  |
| 1.28805298797171 | 0.96 | 1.237 | 1.593 |  |  |
| 1.294336173278889 | 0.962 | 1.245 | 1.612 |  |  |
| 1.300619358586069 | 0.964 | 1.253 | 1.63 |  |  |
| 1.306902543893248 | 0.965 | 1.262 | 1.649 |  |  |
| 1.313185729200428 | 0.967 | 1.27 | 1.668 |  |  |
| 1.319468914507607 | 0.969 | 1.278 | 1.686 |  |  |
| 1.325752099814787 | 0.97 | 1.286 | 1.705 |  |  |
| 1.332035285121967 | 0.972 | 1.294 | 1.724 |  |  |
| 1.338318470429146 | 0.973 | 1.302 | 1.743 |  |  |
| 1.344601655736326 | 0.975 | 1.31 | 1.762 |  |  |
| 1.350884841043506 | 0.976 | 1.318 | 1.781 |  |  |
| 1.357168026350685 | 0.977 | 1.326 | 1.8 |  |  |
| 1.363451211657865 | 0.979 | 1.334 | 1.819 |  |  |
| 1.369734396965045 | 0.98 | 1.342 | 1.838 |  |  |
| 1.376017582272224 | 0.981 | 1.35 | 1.858 |  |  |
| 1.382300767579404 | 0.982 | 1.358 | 1.877 |  |  |
| 1.388583952886583 | 0.983 | 1.366 | 1.896 |  |  |
| 1.394867138193763 | 0.985 | 1.373 | 1.916 |  |  |
| 1.401150323500943 | 0.986 | 1.381 | 1.935 |  |  |
| 1.407433508808122 | 0.987 | 1.389 | 1.954 |  |  |
| 1.413716694115302 | 0.988 | 1.396 | 1.974 |  |  |
| 1.419999879422482 | 0.989 | 1.404 | 1.994 |  |  |
| 1.426283064729661 | 0.99 | 1.411 | 2.013 |  |  |
| 1.432566250036841 | 0.99 | 1.419 | 2.033 |  |  |
| 1.438849435344021 | 0.991 | 1.426 | 2.052 |  |  |
| 1.4451326206512 | 0.992 | 1.434 | 2.072 |  |  |
| 1.45141580595838 | 0.993 | 1.441 | 2.092 |  |  |
| 1.45769899126556 | 0.994 | 1.448 | 2.111 |  |  |
| 1.46398217657274 | 0.994 | 1.456 | 2.131 |  |  |
| 1.470265361879919 | 0.995 | 1.463 | 2.151 |  |  |
| 1.476548547187098 | 0.996 | 1.47 | 2.171 |  |  |
| 1.482831732494278 | 0.996 | 1.477 | 2.19 |  |  |
| 1.489114917801458 | 0.997 | 1.484 | 2.21 |  |  |
| 1.495398103108637 | 0.997 | 1.491 | 2.23 |  |  |
| 1.501681288415817 | 0.998 | 1.498 | 2.25 |  |  |
| 1.507964473722997 | 0.998 | 1.505 | 2.269 |  |  |
| 1.514247659030176 | 0.998 | 1.512 | 2.289 |  |  |
| 1.520530844337356 | 0.999 | 1.519 | 2.309 |  |  |
| 1.526814029644536 | 0.999 | 1.525 | 2.329 |  |  |
| 1.533097214951715 | 0.999 | 1.532 | 2.349 |  |  |
| 1.539380400258895 | 1 | 1.539 | 2.369 |  |  |
| 1.545663585566075 | 1 | 1.545 | 2.388 |  |  |
| 1.551946770873254 | 1 | 1.552 | 2.408 |  |  |
| 1.558229956180434 | 1 | 1.558 | 2.428 |  |  |
| 1.564513141487613 | 1 | 1.564 | 2.448 |  |  |
| 1.570796326794793 | 1 | 1.571 | 2.467 |  |  |
| 1.577079512101973 | 1 | 1.577 | 2.487 |  |  |
| 1.583362697409152 | 1 | 1.583 | 2.507 |  |  |
| 1.589645882716332 | 1 | 1.589 | 2.527 |  |  |
| 1.595929068023512 | 1 | 1.595 | 2.546 |  |  |
| 1.602212253330691 | 1 | 1.601 | 2.566 |  |  |
| 1.608495438637871 | 0.999 | 1.607 | 2.585 |  |  |
| 1.61477862394505 | 0.999 | 1.613 | 2.605 |  |  |
| 1.62106180925223 | 0.999 | 1.619 | 2.625 |  |  |
| 1.62734499455941 | 0.998 | 1.625 | 2.644 |  |  |
| 1.633628179866589 | 0.998 | 1.63 | 2.663 |  |  |
| 1.63991136517377 | 0.998 | 1.636 | 2.683 |  |  |
| 1.646194550480949 | 0.997 | 1.642 | 2.702 |  |  |
| 1.652477735788128 | 0.997 | 1.647 | 2.722 |  |  |
| 1.658760921095308 | 0.996 | 1.652 | 2.741 |  |  |
| 1.665044106402488 | 0.996 | 1.658 | 2.76 |  |  |
| 1.671327291709667 | 0.995 | 1.663 | 2.779 |  |  |
| 1.677610477016847 | 0.994 | 1.668 | 2.798 |  |  |
| 1.683893662324026 | 0.994 | 1.673 | 2.817 |  |  |
| 1.690176847631206 | 0.993 | 1.678 | 2.836 |  |  |
| 1.696460032938386 | 0.992 | 1.683 | 2.855 |  |  |
| 1.702743218245565 | 0.991 | 1.688 | 2.874 |  |  |
| 1.709026403552745 | 0.99 | 1.693 | 2.893 |  |  |
| 1.715309588859925 | 0.99 | 1.697 | 2.912 |  |  |
| 1.721592774167104 | 0.989 | 1.702 | 2.93 |  |  |
| 1.727875959474284 | 0.988 | 1.707 | 2.949 |  |  |
| 1.734159144781464 | 0.987 | 1.711 | 2.967 |  |  |
| 1.740442330088643 | 0.986 | 1.715 | 2.986 |  |  |
| 1.746725515395823 | 0.985 | 1.72 | 3.004 |  |  |
| 1.753008700703003 | 0.983 | 1.724 | 3.022 |  |  |
| 1.759291886010182 | 0.982 | 1.728 | 3.04 |  |  |
| 1.765575071317362 | 0.981 | 1.732 | 3.058 |  |  |
| 1.771858256624541 | 0.98 | 1.736 | 3.076 |  |  |
| 1.778141441931721 | 0.979 | 1.74 | 3.094 |  |  |
| 1.784424627238901 | 0.977 | 1.744 | 3.112 |  |  |
| 1.79070781254608 | 0.976 | 1.748 | 3.129 |  |  |
| 1.79699099785326 | 0.975 | 1.751 | 3.147 |  |  |
| 1.80327418316044 | 0.973 | 1.755 | 3.164 |  |  |
| 1.809557368467619 | 0.972 | 1.758 | 3.182 |  |  |
| 1.815840553774799 | 0.97 | 1.762 | 3.199 |  |  |
| 1.822123739081979 | 0.969 | 1.765 | 3.216 |  |  |
| 1.828406924389158 | 0.967 | 1.768 | 3.233 |  |  |
| 1.834690109696338 | 0.965 | 1.771 | 3.25 |  |  |
| 1.840973295003518 | 0.964 | 1.774 | 3.266 |  |  |
| 1.847256480310697 | 0.962 | 1.777 | 3.283 |  |  |
| 1.853539665617877 | 0.96 | 1.78 | 3.299 |  |  |
| 1.859822850925056 | 0.959 | 1.783 | 3.315 |  |  |
| 1.866106036232236 | 0.957 | 1.785 | 3.332 |  |  |
| 1.872389221539416 | 0.955 | 1.788 | 3.348 |  |  |
| 1.878672406846595 | 0.953 | 1.79 | 3.363 |  |  |
| 1.884955592153775 | 0.951 | 1.793 | 3.379 |  |  |
| 1.891238777460955 | 0.949 | 1.795 | 3.395 |  |  |
| 1.897521962768134 | 0.947 | 1.797 | 3.41 |  |  |
| 1.903805148075314 | 0.945 | 1.799 | 3.425 |  |  |
| 1.910088333382494 | 0.943 | 1.801 | 3.44 |  |  |
| 1.916371518689673 | 0.941 | 1.803 | 3.455 |  |  |
| 1.922654703996853 | 0.939 | 1.805 | 3.47 |  |  |
| 1.928937889304033 | 0.937 | 1.807 | 3.485 |  |  |
| 1.935221074611212 | 0.934 | 1.808 | 3.499 |  |  |
| 1.941504259918392 | 0.932 | 1.81 | 3.513 |  |  |
| 1.947787445225571 | 0.93 | 1.811 | 3.527 |  |  |
| 1.954070630532751 | 0.927 | 1.812 | 3.541 |  |  |
| 1.960353815839931 | 0.925 | 1.813 | 3.555 |  |  |
| 1.96663700114711 | 0.923 | 1.815 | 3.569 |  |  |
| 1.97292018645429 | 0.92 | 1.816 | 3.582 |  |  |
| 1.97920337176147 | 0.918 | 1.816 | 3.595 |  |  |
| 1.985486557068649 | 0.915 | 1.817 | 3.608 |  |  |
| 1.991769742375829 | 0.913 | 1.818 | 3.621 |  |  |
| 1.998052927683009 | 0.91 | 1.818 | 3.633 |  |  |
| 2.004336112990188 | 0.907 | 1.819 | 3.646 |  |  |
| 2.010619298297368 | 0.905 | 1.819 | 3.658 |  |  |
| 2.016902483604547 | 0.902 | 1.82 | 3.67 |  |  |
| 2.023185668911727 | 0.899 | 1.82 | 3.682 |  |  |
| 2.029468854218907 | 0.897 | 1.82 | 3.693 |  |  |
| 2.035752039526086 | 0.894 | 1.82 | 3.704 |  |  |
| 2.042035224833266 | 0.891 | 1.819 | 3.715 |  |  |
| 2.048318410140446 | 0.888 | 1.819 | 3.726 |  |  |
| 2.054601595447625 | 0.885 | 1.819 | 3.737 |  |  |
| 2.060884780754805 | 0.882 | 1.818 | 3.747 |  |  |
| 2.067167966061984 | 0.879 | 1.818 | 3.757 |  |  |
| 2.073451151369164 | 0.876 | 1.817 | 3.767 |  |  |
| 2.079734336676344 | 0.873 | 1.816 | 3.777 |  |  |
| 2.086017521983524 | 0.87 | 1.815 | 3.787 |  |  |
| 2.092300707290703 | 0.867 | 1.814 | 3.796 |  |  |
| 2.098583892597883 | 0.864 | 1.813 | 3.805 |  |  |
| 2.104867077905062 | 0.861 | 1.812 | 3.813 |  |  |
| 2.111150263212242 | 0.858 | 1.81 | 3.822 |  |  |
| 2.117433448519422 | 0.854 | 1.809 | 3.83 |  |  |
| 2.123716633826601 | 0.851 | 1.807 | 3.838 |  |  |
| 2.129999819133781 | 0.848 | 1.806 | 3.846 |  |  |
| 2.136283004440961 | 0.844 | 1.804 | 3.853 |  |  |
| 2.14256618974814 | 0.841 | 1.802 | 3.86 |  |  |
| 2.14884937505532 | 0.838 | 1.8 | 3.867 |  |  |
| 2.1551325603625 | 0.834 | 1.798 | 3.874 |  |  |
| 2.16141574566968 | 0.831 | 1.795 | 3.88 |  |  |
| 2.167698930976859 | 0.827 | 1.793 | 3.886 |  |  |
| 2.173982116284038 | 0.824 | 1.79 | 3.892 |  |  |
| 2.180265301591218 | 0.82 | 1.788 | 3.898 |  |  |
| 2.186548486898398 | 0.816 | 1.785 | 3.903 |  |  |
| 2.192831672205577 | 0.813 | 1.782 | 3.908 |  |  |
| 2.199114857512757 | 0.809 | 1.779 | 3.912 |  |  |
| 2.205398042819936 | 0.805 | 1.776 | 3.917 |  |  |
| 2.211681228127116 | 0.802 | 1.773 | 3.921 |  |  |
| 2.217964413434296 | 0.798 | 1.769 | 3.925 |  |  |
| 2.224247598741475 | 0.794 | 1.766 | 3.928 |  |  |
| 2.230530784048655 | 0.79 | 1.762 | 3.931 |  |  |
| 2.236813969355835 | 0.786 | 1.759 | 3.934 |  |  |
| 2.243097154663014 | 0.782 | 1.755 | 3.937 |  |  |
| 2.249380339970194 | 0.778 | 1.751 | 3.939 |  |  |
| 2.255663525277374 | 0.775 | 1.747 | 3.941 |  |  |
| 2.261946710584553 | 0.771 | 1.743 | 3.942 |  |  |
| 2.268229895891733 | 0.766 | 1.739 | 3.944 |  |  |
| 2.274513081198912 | 0.762 | 1.734 | 3.944 |  |  |
| 2.280796266506092 | 0.758 | 1.73 | 3.945 |  |  |
| 2.287079451813272 | 0.754 | 1.725 | 3.945 |  |  |
| 2.293362637120452 | 0.75 | 1.72 | 3.945 |  |  |
| 2.299645822427631 | 0.746 | 1.715 | 3.945 |  |  |
| 2.305929007734811 | 0.742 | 1.71 | 3.944 |  |  |
| 2.312212193041991 | 0.738 | 1.705 | 3.943 |  |  |
| 2.31849537834917 | 0.733 | 1.7 | 3.942 |  |  |
| 2.32477856365635 | 0.729 | 1.695 | 3.94 |  |  |
| 2.331061748963529 | 0.725 | 1.689 | 3.938 |  |  |
| 2.337344934270709 | 0.72 | 1.684 | 3.935 |  |  |
| 2.343628119577889 | 0.716 | 1.678 | 3.932 |  |  |
| 2.349911304885068 | 0.712 | 1.672 | 3.929 |  |  |
| 2.356194490192248 | 0.707 | 1.666 | 3.926 |  |  |
| 2.362477675499428 | 0.703 | 1.66 | 3.922 |  |  |
| 2.368760860806607 | 0.698 | 1.654 | 3.917 |  |  |
| 2.375044046113787 | 0.694 | 1.647 | 3.913 |  |  |
| 2.381327231420966 | 0.689 | 1.641 | 3.908 |  |  |
| 2.387610416728146 | 0.685 | 1.634 | 3.902 |  |  |
| 2.393893602035326 | 0.68 | 1.628 | 3.897 |  |  |
| 2.400176787342505 | 0.675 | 1.621 | 3.89 |  |  |
| 2.406459972649685 | 0.671 | 1.614 | 3.884 |  |  |
| 2.412743157956865 | 0.666 | 1.607 | 3.877 |  |  |
| 2.419026343264044 | 0.661 | 1.6 | 3.87 |  |  |
| 2.425309528571224 | 0.657 | 1.592 | 3.862 |  |  |
| 2.431592713878404 | 0.652 | 1.585 | 3.854 |  |  |
| 2.437875899185583 | 0.647 | 1.577 | 3.846 |  |  |
| 2.444159084492763 | 0.642 | 1.57 | 3.837 |  |  |
| 2.450442269799943 | 0.637 | 1.562 | 3.828 |  |  |
| 2.456725455107122 | 0.633 | 1.554 | 3.818 |  |  |
| 2.463008640414302 | 0.628 | 1.546 | 3.808 |  |  |
| 2.469291825721482 | 0.623 | 1.538 | 3.797 |  |  |
| 2.475575011028661 | 0.618 | 1.53 | 3.787 |  |  |
| 2.481858196335841 | 0.613 | 1.521 | 3.775 |  |  |
| 2.48814138164302 | 0.608 | 1.513 | 3.764 |  |  |
| 2.4944245669502 | 0.603 | 1.504 | 3.752 |  |  |
| 2.50070775225738 | 0.598 | 1.495 | 3.739 |  |  |
| 2.506990937564559 | 0.593 | 1.486 | 3.726 |  |  |
| 2.51327412287174 | 0.588 | 1.477 | 3.713 |  |  |
| 2.519557308178919 | 0.583 | 1.468 | 3.699 |  |  |
| 2.525840493486098 | 0.578 | 1.459 | 3.685 |  |  |
| 2.532123678793278 | 0.572 | 1.449 | 3.67 |  |  |
| 2.538406864100458 | 0.567 | 1.44 | 3.655 |  |  |
| 2.544690049407637 | 0.562 | 1.43 | 3.64 |  |  |
| 2.550973234714817 | 0.557 | 1.421 | 3.624 |  |  |
| 2.557256420021996 | 0.552 | 1.411 | 3.608 |  |  |
| 2.563539605329176 | 0.546 | 1.401 | 3.591 |  |  |
| 2.569822790636356 | 0.541 | 1.391 | 3.574 |  |  |
| 2.576105975943535 | 0.536 | 1.38 | 3.556 |  |  |
| 2.582389161250715 | 0.531 | 1.37 | 3.538 |  |  |
| 2.588672346557895 | 0.525 | 1.36 | 3.519 |  |  |
| 2.594955531865074 | 0.52 | 1.349 | 3.5 |  |  |
| 2.601238717172254 | 0.514 | 1.338 | 3.481 |  |  |
| 2.607521902479433 | 0.509 | 1.327 | 3.461 |  |  |
| 2.613805087786613 | 0.504 | 1.316 | 3.441 |  |  |
| 2.620088273093793 | 0.498 | 1.305 | 3.42 |  |  |
| 2.626371458400972 | 0.493 | 1.294 | 3.399 |  |  |
| 2.632654643708152 | 0.487 | 1.283 | 3.377 |  |  |
| 2.638937829015332 | 0.482 | 1.271 | 3.355 |  |  |
| 2.645221014322511 | 0.476 | 1.26 | 3.332 |  |  |
| 2.651504199629691 | 0.471 | 1.248 | 3.309 |  |  |
| 2.657787384936871 | 0.465 | 1.236 | 3.286 |  |  |
| 2.66407057024405 | 0.46 | 1.224 | 3.262 |  |  |
| 2.67035375555123 | 0.454 | 1.212 | 3.237 |  |  |
| 2.67663694085841 | 0.448 | 1.2 | 3.212 |  |  |
| 2.682920126165589 | 0.443 | 1.188 | 3.187 |  |  |
| 2.689203311472769 | 0.437 | 1.175 | 3.161 |  |  |
| 2.695486496779948 | 0.431 | 1.163 | 3.135 |  |  |
| 2.701769682087128 | 0.426 | 1.15 | 3.108 |  |  |
| 2.708052867394308 | 0.42 | 1.138 | 3.081 |  |  |
| 2.714336052701487 | 0.414 | 1.125 | 3.053 |  |  |
| 2.720619238008667 | 0.409 | 1.112 | 3.025 |  |  |
| 2.726902423315847 | 0.403 | 1.099 | 2.996 |  |  |
| 2.733185608623026 | 0.397 | 1.085 | 2.967 |  |  |
| 2.739468793930206 | 0.391 | 1.072 | 2.937 |  |  |
| 2.745751979237386 | 0.386 | 1.059 | 2.907 |  |  |
| 2.752035164544565 | 0.38 | 1.045 | 2.876 |  |  |
| 2.758318349851745 | 0.374 | 1.031 | 2.845 |  |  |
| 2.764601535158925 | 0.368 | 1.018 | 2.814 |  |  |
| 2.770884720466104 | 0.362 | 1.004 | 2.781 |  |  |
| 2.777167905773284 | 0.356 | 0.99 | 2.749 |  |  |
| 2.783451091080463 | 0.351 | 0.976 | 2.716 |  |  |
| 2.789734276387643 | 0.345 | 0.961 | 2.682 |  |  |
| 2.796017461694823 | 0.339 | 0.947 | 2.648 |  |  |
| 2.802300647002002 | 0.333 | 0.933 | 2.614 |  |  |
| 2.808583832309182 | 0.327 | 0.918 | 2.579 |  |  |
| 2.814867017616362 | 0.321 | 0.903 | 2.543 |  |  |
| 2.821150202923541 | 0.315 | 0.889 | 2.507 |  |  |
| 2.827433388230721 | 0.309 | 0.874 | 2.47 |  |  |
| 2.833716573537901 | 0.303 | 0.859 | 2.433 |  |  |
| 2.83999975884508 | 0.297 | 0.844 | 2.396 |  |  |
| 2.84628294415226 | 0.291 | 0.828 | 2.358 |  |  |
| 2.852566129459439 | 0.285 | 0.813 | 2.319 |  |  |
| 2.858849314766619 | 0.279 | 0.798 | 2.28 |  |  |
| 2.865132500073799 | 0.273 | 0.782 | 2.241 |  |  |
| 2.871415685380978 | 0.267 | 0.766 | 2.201 |  |  |
| 2.877698870688158 | 0.261 | 0.751 | 2.16 |  |  |
| 2.883982055995337 | 0.255 | 0.735 | 2.119 |  |  |
| 2.890265241302517 | 0.249 | 0.719 | 2.077 |  |  |
| 2.896548426609697 | 0.243 | 0.703 | 2.035 |  |  |
| 2.902831611916877 | 0.236 | 0.687 | 1.993 |  |  |
| 2.909114797224056 | 0.23 | 0.67 | 1.95 |  |  |
| 2.915397982531236 | 0.224 | 0.654 | 1.906 |  |  |
| 2.921681167838416 | 0.218 | 0.637 | 1.862 |  |  |
| 2.927964353145595 | 0.212 | 0.621 | 1.818 |  |  |
| 2.934247538452775 | 0.206 | 0.604 | 1.772 |  |  |
| 2.940530723759954 | 0.2 | 0.587 | 1.727 |  |  |
| 2.946813909067134 | 0.194 | 0.57 | 1.681 |  |  |
| 2.953097094374314 | 0.187 | 0.553 | 1.634 |  |  |
| 2.959380279681493 | 0.181 | 0.536 | 1.587 |  |  |
| 2.965663464988673 | 0.175 | 0.519 | 1.539 |  |  |
| 2.971946650295853 | 0.169 | 0.502 | 1.491 |  |  |
| 2.978229835603032 | 0.163 | 0.484 | 1.443 |  |  |
| 2.984513020910212 | 0.156 | 0.467 | 1.393 |  |  |
| 2.990796206217391 | 0.15 | 0.449 | 1.344 |  |  |
| 2.997079391524571 | 0.144 | 0.432 | 1.294 |  |  |
| 3.003362576831751 | 0.138 | 0.414 | 1.243 |  |  |
| 3.009645762138931 | 0.132 | 0.396 | 1.192 |  |  |
| 3.01592894744611 | 0.125 | 0.378 | 1.14 |  |  |
| 3.02221213275329 | 0.119 | 0.36 | 1.088 |  |  |
| 3.028495318060469 | 0.113 | 0.342 | 1.035 |  |  |
| 3.034778503367649 | 0.107 | 0.324 | 0.982 |  |  |
| 3.041061688674829 | 0.1 | 0.305 | 0.928 |  |  |
| 3.047344873982008 | 0.094 | 0.287 | 0.874 |  |  |
| 3.053628059289188 | 0.088 | 0.268 | 0.819 |  |  |
| 3.059911244596367 | 0.082 | 0.25 | 0.764 |  |  |
| 3.066194429903547 | 0.075 | 0.231 | 0.708 |  |  |
| 3.072477615210727 | 0.069 | 0.212 | 0.652 |  |  |
| 3.078760800517906 | 0.063 | 0.193 | 0.595 |  |  |
| 3.085043985825086 | 0.057 | 0.174 | 0.538 |  |  |
| 3.091327171132266 | 0.05 | 0.155 | 0.48 |  |  |
| 3.097610356439445 | 0.044 | 0.136 | 0.422 |  |  |
| 3.103893541746625 | 0.038 | 0.117 | 0.363 |  |  |
| 3.110176727053805 | 0.031 | 0.098 | 0.304 |  |  |
| 3.116459912360984 | 0.025 | 0.078 | 0.244 |  |  |
| 3.122743097668164 | 0.019 | 0.059 | 0.184 |  |  |
| 3.129026282975343 | 0.013 | 0.039 | 0.123 |  |  |
| 3.135309468282523 | 0.006 | 0.02 | 0.062 |  |  |
| 3.141592653589703 | 0 | 0 | 0 |  |  |
| 3.147875838896883 | -0.006 | -0.02 | -0.062 |  |  |
| 3.154159024204062 | -0.013 | -0.04 | -0.125 |  |  |
| 3.160442209511242 | -0.019 | -0.06 | -0.188 |  |  |
| 3.166725394818422 | -0.025 | -0.08 | -0.252 |  |  |
| 3.173008580125601 | -0.031 | -0.1 | -0.316 |  |  |
| 3.179291765432781 | -0.038 | -0.12 | -0.381 |  |  |
| 3.18557495073996 | -0.044 | -0.14 | -0.446 |  |  |
| 3.19185813604714 | -0.05 | -0.16 | -0.512 |  |  |
| 3.19814132135432 | -0.057 | -0.181 | -0.578 |  |  |
| 3.2044245066615 | -0.063 | -0.201 | -0.645 |  |  |
| 3.210707691968679 | -0.069 | -0.222 | -0.712 |  |  |
| 3.216990877275859 | -0.075 | -0.242 | -0.78 |  |  |
| 3.223274062583038 | -0.082 | -0.263 | -0.848 |  |  |
| 3.229557247890217 | -0.088 | -0.284 | -0.916 |  |  |
| 3.235840433197398 | -0.094 | -0.305 | -0.985 |  |  |
| 3.242123618504577 | -0.1 | -0.325 | -1.055 |  |  |
| 3.248406803811757 | -0.107 | -0.346 | -1.125 |  |  |
| 3.254689989118936 | -0.113 | -0.367 | -1.195 |  |  |
| 3.260973174426116 | -0.119 | -0.388 | -1.266 |  |  |
| 3.267256359733296 | -0.125 | -0.409 | -1.338 |  |  |
| 3.273539545040475 | -0.132 | -0.431 | -1.41 |  |  |
| 3.279822730347655 | -0.138 | -0.452 | -1.482 |  |  |
| 3.286105915654835 | -0.144 | -0.473 | -1.555 |  |  |
| 3.292389100962014 | -0.15 | -0.495 | -1.628 |  |  |
| 3.298672286269194 | -0.156 | -0.516 | -1.702 |  |  |
| 3.304955471576374 | -0.163 | -0.538 | -1.776 |  |  |
| 3.311238656883553 | -0.169 | -0.559 | -1.851 |  |  |
| 3.317521842190732 | -0.175 | -0.581 | -1.926 |  |  |
| 3.323805027497912 | -0.181 | -0.602 | -2.002 |  |  |
| 3.330088212805092 | -0.187 | -0.624 | -2.078 |  |  |
| 3.336371398112272 | -0.194 | -0.646 | -2.154 |  |  |
| 3.342654583419451 | -0.2 | -0.668 | -2.231 |  |  |
| 3.34893776872663 | -0.206 | -0.689 | -2.309 |  |  |
| 3.355220954033811 | -0.212 | -0.711 | -2.387 |  |  |
| 3.36150413934099 | -0.218 | -0.733 | -2.465 |  |  |
| 3.36778732464817 | -0.224 | -0.755 | -2.544 |  |  |
| 3.37407050995535 | -0.23 | -0.777 | -2.623 |  |  |
| 3.380353695262529 | -0.236 | -0.799 | -2.702 |  |  |
| 3.386636880569709 | -0.243 | -0.822 | -2.782 |  |  |
| 3.392920065876888 | -0.249 | -0.844 | -2.863 |  |  |
| 3.399203251184068 | -0.255 | -0.866 | -2.944 |  |  |
| 3.405486436491248 | -0.261 | -0.888 | -3.025 |  |  |
| 3.411769621798427 | -0.267 | -0.911 | -3.107 |  |  |
| 3.418052807105607 | -0.273 | -0.933 | -3.189 |  |  |
| 3.424335992412787 | -0.279 | -0.955 | -3.271 |  |  |
| 3.430619177719966 | -0.285 | -0.978 | -3.354 |  |  |
| 3.436902363027146 | -0.291 | -1 | -3.438 |  |  |
| 3.443185548334325 | -0.297 | -1.023 | -3.522 |  |  |
| 3.449468733641505 | -0.303 | -1.045 | -3.606 |  |  |
| 3.455751918948685 | -0.309 | -1.068 | -3.69 |  |  |
| 3.462035104255865 | -0.315 | -1.09 | -3.775 |  |  |
| 3.468318289563044 | -0.321 | -1.113 | -3.861 |  |  |
| 3.474601474870224 | -0.327 | -1.136 | -3.946 |  |  |
| 3.480884660177403 | -0.333 | -1.159 | -4.033 |  |  |
| 3.487167845484583 | -0.339 | -1.181 | -4.119 |  |  |
| 3.493451030791763 | -0.345 | -1.204 | -4.206 |  |  |
| 3.499734216098942 | -0.351 | -1.227 | -4.293 |  |  |
| 3.506017401406122 | -0.356 | -1.25 | -4.381 |  |  |
| 3.512300586713302 | -0.362 | -1.272 | -4.469 |  |  |
| 3.518583772020481 | -0.368 | -1.295 | -4.558 |  |  |
| 3.524866957327661 | -0.374 | -1.318 | -4.646 |  |  |
| 3.531150142634841 | -0.38 | -1.341 | -4.735 |  |  |
| 3.53743332794202 | -0.386 | -1.364 | -4.825 |  |  |
| 3.5437165132492 | -0.391 | -1.387 | -4.915 |  |  |
| 3.54999969855638 | -0.397 | -1.41 | -5.005 |  |  |
| 3.556282883863559 | -0.403 | -1.433 | -5.096 |  |  |
| 3.562566069170739 | -0.409 | -1.456 | -5.187 |  |  |
| 3.568849254477918 | -0.414 | -1.479 | -5.278 |  |  |
| 3.575132439785098 | -0.42 | -1.502 | -5.369 |  |  |
| 3.581415625092278 | -0.426 | -1.525 | -5.461 |  |  |
| 3.587698810399457 | -0.431 | -1.548 | -5.554 |  |  |
| 3.593981995706637 | -0.437 | -1.571 | -5.646 |  |  |
| 3.600265181013817 | -0.443 | -1.594 | -5.739 |  |  |
| 3.606548366320996 | -0.448 | -1.617 | -5.832 |  |  |
| 3.612831551628176 | -0.454 | -1.64 | -5.926 |  |  |
| 3.619114736935355 | -0.46 | -1.663 | -6.02 |  |  |
| 3.625397922242535 | -0.465 | -1.686 | -6.114 |  |  |
| 3.631681107549715 | -0.471 | -1.709 | -6.208 |  |  |
| 3.637964292856894 | -0.476 | -1.733 | -6.303 |  |  |
| 3.644247478164074 | -0.482 | -1.756 | -6.398 |  |  |
| 3.650530663471254 | -0.487 | -1.779 | -6.493 |  |  |
| 3.656813848778433 | -0.493 | -1.802 | -6.589 |  |  |
| 3.663097034085613 | -0.498 | -1.825 | -6.685 |  |  |
| 3.669380219392792 | -0.504 | -1.848 | -6.781 |  |  |
| 3.675663404699972 | -0.509 | -1.871 | -6.877 |  |  |
| 3.681946590007152 | -0.514 | -1.894 | -6.974 |  |  |
| 3.688229775314331 | -0.52 | -1.917 | -7.071 |  |  |
| 3.694512960621511 | -0.525 | -1.94 | -7.168 |  |  |
| 3.700796145928691 | -0.531 | -1.963 | -7.266 |  |  |
| 3.70707933123587 | -0.536 | -1.986 | -7.364 |  |  |
| 3.71336251654305 | -0.541 | -2.009 | -7.462 |  |  |
| 3.71964570185023 | -0.546 | -2.032 | -7.56 |  |  |
| 3.72592888715741 | -0.552 | -2.055 | -7.658 |  |  |
| 3.732212072464589 | -0.557 | -2.078 | -7.757 |  |  |
| 3.738495257771769 | -0.562 | -2.101 | -7.856 |  |  |
| 3.744778443078948 | -0.567 | -2.124 | -7.955 |  |  |
| 3.751061628386128 | -0.572 | -2.147 | -8.054 |  |  |
| 3.757344813693308 | -0.578 | -2.17 | -8.154 |  |  |
| 3.763627999000487 | -0.583 | -2.193 | -8.254 |  |  |
| 3.769911184307667 | -0.588 | -2.216 | -8.354 |  |  |
| 3.776194369614846 | -0.593 | -2.239 | -8.454 |  |  |
| 3.782477554922026 | -0.598 | -2.262 | -8.554 |  |  |
| 3.788760740229206 | -0.603 | -2.284 | -8.655 |  |  |
| 3.795043925536385 | -0.608 | -2.307 | -8.756 |  |  |
| 3.801327110843565 | -0.613 | -2.33 | -8.857 |  |  |
| 3.807610296150745 | -0.618 | -2.353 | -8.958 |  |  |
| 3.813893481457924 | -0.623 | -2.375 | -9.059 |  |  |
| 3.820176666765104 | -0.628 | -2.398 | -9.16 |  |  |
| 3.826459852072284 | -0.633 | -2.421 | -9.262 |  |  |
| 3.832743037379463 | -0.637 | -2.443 | -9.364 |  |  |
| 3.839026222686643 | -0.642 | -2.466 | -9.466 |  |  |
| 3.845309407993823 | -0.647 | -2.488 | -9.568 |  |  |
| 3.851592593301002 | -0.652 | -2.511 | -9.67 |  |  |
| 3.857875778608182 | -0.657 | -2.533 | -9.772 |  |  |
| 3.864158963915361 | -0.661 | -2.555 | -9.875 |  |  |
| 3.870442149222541 | -0.666 | -2.578 | -9.977 |  |  |
| 3.876725334529721 | -0.671 | -2.6 | -10.08 |  |  |
| 3.8830085198369 | -0.675 | -2.622 | -10.183 |  |  |
| 3.88929170514408 | -0.68 | -2.645 | -10.285 |  |  |
| 3.89557489045126 | -0.685 | -2.667 | -10.388 |  |  |
| 3.901858075758439 | -0.689 | -2.689 | -10.491 |  |  |
| 3.908141261065619 | -0.694 | -2.711 | -10.595 |  |  |
| 3.914424446372799 | -0.698 | -2.733 | -10.698 |  |  |
| 3.920707631679978 | -0.703 | -2.755 | -10.801 |  |  |
| 3.926990816987158 | -0.707 | -2.777 | -10.904 |  |  |
| 3.933274002294337 | -0.712 | -2.799 | -11.008 |  |  |
| 3.939557187601517 | -0.716 | -2.82 | -11.111 |  |  |
| 3.945840372908697 | -0.72 | -2.842 | -11.215 |  |  |
| 3.952123558215876 | -0.725 | -2.864 | -11.319 |  |  |
| 3.958406743523056 | -0.729 | -2.886 | -11.422 |  |  |
| 3.964689928830236 | -0.733 | -2.907 | -11.526 |  |  |
| 3.970973114137415 | -0.738 | -2.929 | -11.63 |  |  |
| 3.977256299444595 | -0.742 | -2.95 | -11.733 |  |  |
| 3.983539484751775 | -0.746 | -2.971 | -11.837 |  |  |
| 3.989822670058954 | -0.75 | -2.993 | -11.941 |  |  |
| 3.996105855366134 | -0.754 | -3.014 | -12.045 |  |  |
| 4.002389040673314 | -0.758 | -3.035 | -12.148 |  |  |
| 4.008672225980493 | -0.762 | -3.056 | -12.252 |  |  |
| 4.014955411287672 | -0.766 | -3.077 | -12.356 |  |  |
| 4.021238596594851 | -0.771 | -3.098 | -12.459 |  |  |
| 4.02752178190203 | -0.775 | -3.119 | -12.563 |  |  |
| 4.03380496720921 | -0.778 | -3.14 | -12.667 |  |  |
| 4.040088152516389 | -0.782 | -3.161 | -12.77 |  |  |
| 4.046371337823567 | -0.786 | -3.182 | -12.874 |  |  |
| 4.052654523130747 | -0.79 | -3.202 | -12.978 |  |  |
| 4.058937708437926 | -0.794 | -3.223 | -13.081 |  |  |
| 4.065220893745105 | -0.798 | -3.243 | -13.184 |  |  |
| 4.071504079052285 | -0.802 | -3.264 | -13.288 |  |  |
| 4.077787264359464 | -0.805 | -3.284 | -13.391 |  |  |
| 4.084070449666643 | -0.809 | -3.304 | -13.494 |  |  |
| 4.090353634973822 | -0.813 | -3.324 | -13.597 |  |  |
| 4.096636820281001 | -0.816 | -3.344 | -13.7 |  |  |
| 4.102920005588181 | -0.82 | -3.364 | -13.803 |  |  |
| 4.10920319089536 | -0.824 | -3.384 | -13.906 |  |  |
| 4.115486376202539 | -0.827 | -3.404 | -14.008 |  |  |
| 4.121769561509718 | -0.831 | -3.424 | -14.111 |  |  |
| 4.128052746816897 | -0.834 | -3.443 | -14.213 |  |  |
| 4.134335932124077 | -0.838 | -3.463 | -14.316 |  |  |
| 4.140619117431256 | -0.841 | -3.482 | -14.418 |  |  |
| 4.146902302738435 | -0.844 | -3.501 | -14.52 |  |  |
| 4.153185488045614 | -0.848 | -3.521 | -14.622 |  |  |
| 4.159468673352793 | -0.851 | -3.54 | -14.723 |  |  |
| 4.165751858659973 | -0.854 | -3.559 | -14.825 |  |  |
| 4.172035043967152 | -0.858 | -3.578 | -14.926 |  |  |
| 4.178318229274331 | -0.861 | -3.596 | -15.027 |  |  |
| 4.18460141458151 | -0.864 | -3.615 | -15.128 |  |  |
| 4.190884599888689 | -0.867 | -3.634 | -15.229 |  |  |
| 4.197167785195868 | -0.87 | -3.652 | -15.329 |  |  |
| 4.203450970503048 | -0.873 | -3.671 | -15.43 |  |  |
| 4.209734155810227 | -0.876 | -3.689 | -15.53 |  |  |
| 4.216017341117406 | -0.879 | -3.707 | -15.63 |  |  |
| 4.222300526424585 | -0.882 | -3.725 | -15.729 |  |  |
| 4.228583711731764 | -0.885 | -3.743 | -15.829 |  |  |
| 4.234866897038944 | -0.888 | -3.761 | -15.928 |  |  |
| 4.241150082346122 | -0.891 | -3.779 | -16.027 |  |  |
| 4.247433267653302 | -0.894 | -3.797 | -16.126 |  |  |
| 4.253716452960481 | -0.897 | -3.814 | -16.224 |  |  |
| 4.25999963826766 | -0.899 | -3.831 | -16.322 |  |  |
| 4.26628282357484 | -0.902 | -3.849 | -16.42 |  |  |
| 4.272566008882019 | -0.905 | -3.866 | -16.517 |  |  |
| 4.278849194189198 | -0.907 | -3.883 | -16.615 |  |  |
| 4.285132379496377 | -0.91 | -3.9 | -16.712 |  |  |
| 4.291415564803557 | -0.913 | -3.917 | -16.808 |  |  |
| 4.297698750110735 | -0.915 | -3.933 | -16.905 |  |  |
| 4.303981935417915 | -0.918 | -3.95 | -17.001 |  |  |
| 4.310265120725094 | -0.92 | -3.966 | -17.096 |  |  |
| 4.316548306032273 | -0.923 | -3.983 | -17.192 |  |  |
| 4.322831491339452 | -0.925 | -3.999 | -17.287 |  |  |
| 4.329114676646632 | -0.927 | -4.015 | -17.381 |  |  |
| 4.335397861953811 | -0.93 | -4.031 | -17.476 |  |  |
| 4.34168104726099 | -0.932 | -4.047 | -17.57 |  |  |
| 4.347964232568169 | -0.934 | -4.062 | -17.663 |  |  |
| 4.354247417875348 | -0.937 | -4.078 | -17.756 |  |  |
| 4.360530603182528 | -0.939 | -4.093 | -17.849 |  |  |
| 4.366813788489707 | -0.941 | -4.109 | -17.942 |  |  |
| 4.373096973796886 | -0.943 | -4.124 | -18.034 |  |  |
| 4.379380159104065 | -0.945 | -4.139 | -18.125 |  |  |
| 4.385663344411244 | -0.947 | -4.154 | -18.217 |  |  |
| 4.391946529718424 | -0.949 | -4.168 | -18.307 |  |  |
| 4.398229715025602 | -0.951 | -4.183 | -18.398 |  |  |
| 4.404512900332782 | -0.953 | -4.197 | -18.488 |  |  |
| 4.41079608563996 | -0.955 | -4.212 | -18.577 |  |  |
| 4.41707927094714 | -0.957 | -4.226 | -18.666 |  |  |
| 4.42336245625432 | -0.959 | -4.24 | -18.755 |  |  |
| 4.429645641561499 | -0.96 | -4.254 | -18.843 |  |  |
| 4.435928826868678 | -0.962 | -4.267 | -18.93 |  |  |
| 4.442212012175857 | -0.964 | -4.281 | -19.017 |  |  |
| 4.448495197483036 | -0.965 | -4.294 | -19.104 |  |  |
| 4.454778382790215 | -0.967 | -4.308 | -19.19 |  |  |
| 4.461061568097395 | -0.969 | -4.321 | -19.276 |  |  |
| 4.467344753404574 | -0.97 | -4.334 | -19.361 |  |  |
| 4.473627938711753 | -0.972 | -4.347 | -19.446 |  |  |
| 4.479911124018932 | -0.973 | -4.359 | -19.53 |  |  |
| 4.486194309326112 | -0.975 | -4.372 | -19.613 |  |  |
| 4.49247749463329 | -0.976 | -4.384 | -19.696 |  |  |
| 4.49876067994047 | -0.977 | -4.396 | -19.779 |  |  |
| 4.50504386524765 | -0.979 | -4.409 | -19.861 |  |  |
| 4.511327050554828 | -0.98 | -4.42 | -19.942 |  |  |
| 4.517610235862008 | -0.981 | -4.432 | -20.023 |  |  |
| 4.523893421169186 | -0.982 | -4.444 | -20.103 |  |  |
| 4.530176606476366 | -0.983 | -4.455 | -20.183 |  |  |
| 4.536459791783545 | -0.985 | -4.466 | -20.262 |  |  |
| 4.542742977090724 | -0.986 | -4.478 | -20.34 |  |  |
| 4.549026162397904 | -0.987 | -4.488 | -20.418 |  |  |
| 4.555309347705083 | -0.988 | -4.499 | -20.495 |  |  |
| 4.561592533012262 | -0.989 | -4.51 | -20.572 |  |  |
| 4.567875718319441 | -0.99 | -4.52 | -20.648 |  |  |
| 4.57415890362662 | -0.99 | -4.531 | -20.723 |  |  |
| 4.5804420889338 | -0.991 | -4.541 | -20.798 |  |  |
| 4.586725274240979 | -0.992 | -4.551 | -20.872 |  |  |
| 4.593008459548158 | -0.993 | -4.56 | -20.946 |  |  |
| 4.599291644855337 | -0.994 | -4.57 | -21.018 |  |  |
| 4.605574830162516 | -0.994 | -4.579 | -21.09 |  |  |
| 4.611858015469695 | -0.995 | -4.589 | -21.162 |  |  |
| 4.618141200776875 | -0.996 | -4.598 | -21.233 |  |  |
| 4.624424386084054 | -0.996 | -4.607 | -21.303 |  |  |
| 4.630707571391233 | -0.997 | -4.615 | -21.372 |  |  |
| 4.636990756698412 | -0.997 | -4.624 | -21.441 |  |  |
| 4.643273942005591 | -0.998 | -4.632 | -21.509 |  |  |
| 4.649557127312771 | -0.998 | -4.64 | -21.576 |  |  |
| 4.65584031261995 | -0.998 | -4.648 | -21.642 |  |  |
| 4.66212349792713 | -0.999 | -4.656 | -21.708 |  |  |
| 4.668406683234308 | -0.999 | -4.664 | -21.773 |  |  |
| 4.674689868541487 | -0.999 | -4.671 | -21.837 |  |  |
| 4.680973053848666 | -1 | -4.679 | -21.901 |  |  |
| 4.687256239155846 | -1 | -4.686 | -21.963 |  |  |
| 4.693539424463024 | -1 | -4.693 | -22.025 |  |  |
| 4.699822609770204 | -1 | -4.699 | -22.087 |  |  |
| 4.706105795077383 | -1 | -4.706 | -22.147 |  |  |
| 4.712388980384562 | -1 | -4.712 | -22.207 |  |  |
| 4.718672165691741 | -1 | -4.719 | -22.265 |  |  |
| 4.724955350998921 | -1 | -4.725 | -22.323 |  |  |
| 4.7312385363061 | -1 | -4.73 | -22.381 |  |  |
| 4.73752172161328 | -1 | -4.736 | -22.437 |  |  |
| 4.743804906920459 | -1 | -4.741 | -22.493 |  |  |
| 4.750088092227637 | -0.999 | -4.747 | -22.547 |  |  |
| 4.756371277534817 | -0.999 | -4.752 | -22.601 |  |  |
| 4.762654462841996 | -0.999 | -4.757 | -22.654 |  |  |
| 4.768937648149175 | -0.998 | -4.761 | -22.706 |  |  |
| 4.775220833456354 | -0.998 | -4.766 | -22.758 |  |  |
| 4.781504018763534 | -0.998 | -4.77 | -22.808 |  |  |
| 4.787787204070713 | -0.997 | -4.774 | -22.858 |  |  |
| 4.794070389377892 | -0.997 | -4.778 | -22.906 |  |  |
| 4.800353574685071 | -0.996 | -4.782 | -22.954 |  |  |
| 4.806636759992251 | -0.996 | -4.785 | -23.001 |  |  |
| 4.81291994529943 | -0.995 | -4.789 | -23.047 |  |  |
| 4.819203130606608 | -0.994 | -4.792 | -23.092 |  |  |
| 4.825486315913788 | -0.994 | -4.795 | -23.137 |  |  |
| 4.831769501220967 | -0.993 | -4.797 | -23.18 |  |  |
| 4.838052686528146 | -0.992 | -4.8 | -23.222 |  |  |
| 4.844335871835326 | -0.991 | -4.802 | -23.264 |  |  |
| 4.850619057142505 | -0.99 | -4.804 | -23.304 |  |  |
| 4.856902242449684 | -0.99 | -4.806 | -23.344 |  |  |
| 4.863185427756863 | -0.989 | -4.808 | -23.382 |  |  |
| 4.869468613064042 | -0.988 | -4.81 | -23.42 |  |  |
| 4.875751798371221 | -0.987 | -4.811 | -23.456 |  |  |
| 4.882034983678401 | -0.986 | -4.812 | -23.492 |  |  |
| 4.88831816898558 | -0.985 | -4.813 | -23.527 |  |  |
| 4.894601354292759 | -0.983 | -4.814 | -23.561 |  |  |
| 4.900884539599939 | -0.982 | -4.814 | -23.593 |  |  |
| 4.907167724907117 | -0.981 | -4.814 | -23.625 |  |  |
| 4.913450910214297 | -0.98 | -4.814 | -23.656 |  |  |
| 4.919734095521476 | -0.979 | -4.814 | -23.685 |  |  |
| 4.926017280828655 | -0.977 | -4.814 | -23.714 |  |  |
| 4.932300466135834 | -0.976 | -4.814 | -23.742 |  |  |
| 4.938583651443014 | -0.975 | -4.813 | -23.768 |  |  |
| 4.944866836750193 | -0.973 | -4.812 | -23.794 |  |  |
| 4.951150022057372 | -0.972 | -4.811 | -23.818 |  |  |
| 4.957433207364551 | -0.97 | -4.809 | -23.842 |  |  |
| 4.96371639267173 | -0.969 | -4.808 | -23.864 |  |  |
| 4.96999957797891 | -0.967 | -4.806 | -23.886 |  |  |
| 4.976282763286088 | -0.965 | -4.804 | -23.906 |  |  |
| 4.982565948593268 | -0.964 | -4.802 | -23.925 |  |  |
| 4.988849133900447 | -0.962 | -4.799 | -23.944 |  |  |
| 4.995132319207626 | -0.96 | -4.797 | -23.961 |  |  |
| 5.001415504514805 | -0.959 | -4.794 | -23.977 |  |  |
| 5.007698689821984 | -0.957 | -4.791 | -23.992 |  |  |
| 5.013981875129164 | -0.955 | -4.788 | -24.005 |  |  |
| 5.020265060436343 | -0.953 | -4.784 | -24.018 |  |  |
| 5.026548245743522 | -0.951 | -4.781 | -24.03 |  |  |
| 5.032831431050702 | -0.949 | -4.777 | -24.04 |  |  |
| 5.039114616357881 | -0.947 | -4.773 | -24.049 |  |  |
| 5.04539780166506 | -0.945 | -4.768 | -24.058 |  |  |
| 5.05168098697224 | -0.943 | -4.764 | -24.065 |  |  |
| 5.057964172279418 | -0.941 | -4.759 | -24.071 |  |  |
| 5.064247357586598 | -0.939 | -4.754 | -24.075 |  |  |
| 5.070530542893777 | -0.937 | -4.749 | -24.079 |  |  |
| 5.076813728200956 | -0.934 | -4.743 | -24.081 |  |  |
| 5.083096913508135 | -0.932 | -4.738 | -24.083 |  |  |
| 5.089380098815314 | -0.93 | -4.732 | -24.083 |  |  |
| 5.095663284122493 | -0.927 | -4.726 | -24.082 |  |  |
| 5.101946469429673 | -0.925 | -4.72 | -24.08 |  |  |
| 5.108229654736852 | -0.923 | -4.713 | -24.076 |  |  |
| 5.114512840044031 | -0.92 | -4.707 | -24.072 |  |  |
| 5.12079602535121 | -0.918 | -4.7 | -24.066 |  |  |
| 5.12707921065839 | -0.915 | -4.693 | -24.059 |  |  |
| 5.133362395965568 | -0.913 | -4.685 | -24.051 |  |  |
| 5.139645581272747 | -0.91 | -4.678 | -24.041 |  |  |
| 5.145928766579927 | -0.907 | -4.67 | -24.031 |  |  |
| 5.152211951887106 | -0.905 | -4.662 | -24.019 |  |  |
| 5.158495137194286 | -0.902 | -4.654 | -24.006 |  |  |
| 5.164778322501465 | -0.899 | -4.645 | -23.992 |  |  |
| 5.171061507808644 | -0.897 | -4.637 | -23.976 |  |  |
| 5.177344693115823 | -0.894 | -4.628 | -23.959 |  |  |
| 5.183627878423002 | -0.891 | -4.619 | -23.941 |  |  |
| 5.189911063730181 | -0.888 | -4.609 | -23.922 |  |  |
| 5.196194249037361 | -0.885 | -4.6 | -23.902 |  |  |
| 5.20247743434454 | -0.882 | -4.59 | -23.88 |  |  |
| 5.20876061965172 | -0.879 | -4.58 | -23.857 |  |  |
| 5.215043804958898 | -0.876 | -4.57 | -23.833 |  |  |
| 5.221326990266077 | -0.873 | -4.56 | -23.807 |  |  |
| 5.227610175573257 | -0.87 | -4.549 | -23.78 |  |  |
| 5.233893360880435 | -0.867 | -4.538 | -23.752 |  |  |
| 5.240176546187615 | -0.864 | -4.527 | -23.723 |  |  |
| 5.246459731494794 | -0.861 | -4.516 | -23.692 |  |  |
| 5.252742916801973 | -0.858 | -4.504 | -23.66 |  |  |
| 5.259026102109152 | -0.854 | -4.493 | -23.627 |  |  |
| 5.265309287416332 | -0.851 | -4.481 | -23.593 |  |  |
| 5.27159247272351 | -0.848 | -4.469 | -23.557 |  |  |
| 5.27787565803069 | -0.844 | -4.456 | -23.52 |  |  |
| 5.284158843337869 | -0.841 | -4.444 | -23.481 |  |  |
| 5.290442028645049 | -0.838 | -4.431 | -23.441 |  |  |
| 5.296725213952227 | -0.834 | -4.418 | -23.4 |  |  |
| 5.303008399259407 | -0.831 | -4.405 | -23.358 |  |  |
| 5.309291584566586 | -0.827 | -4.391 | -23.314 |  |  |
| 5.315574769873765 | -0.824 | -4.378 | -23.269 |  |  |
| 5.321857955180945 | -0.82 | -4.364 | -23.223 |  |  |
| 5.328141140488124 | -0.816 | -4.35 | -23.175 |  |  |
| 5.334424325795303 | -0.813 | -4.335 | -23.126 |  |  |
| 5.340707511102482 | -0.809 | -4.321 | -23.076 |  |  |
| 5.346990696409661 | -0.805 | -4.306 | -23.024 |  |  |
| 5.35327388171684 | -0.802 | -4.291 | -22.971 |  |  |
| 5.35955706702402 | -0.798 | -4.276 | -22.917 |  |  |
| 5.365840252331199 | -0.794 | -4.26 | -22.861 |  |  |
| 5.372123437638378 | -0.79 | -4.245 | -22.804 |  |  |
| 5.378406622945557 | -0.786 | -4.229 | -22.745 |  |  |
| 5.384689808252737 | -0.782 | -4.213 | -22.685 |  |  |
| 5.390972993559916 | -0.778 | -4.197 | -22.624 |  |  |
| 5.397256178867095 | -0.775 | -4.18 | -22.562 |  |  |
| 5.403539364174274 | -0.771 | -4.163 | -22.498 |  |  |
| 5.409822549481453 | -0.766 | -4.147 | -22.432 |  |  |
| 5.416105734788632 | -0.762 | -4.129 | -22.366 |  |  |
| 5.422388920095812 | -0.758 | -4.112 | -22.298 |  |  |
| 5.42867210540299 | -0.754 | -4.095 | -22.228 |  |  |
| 5.43495529071017 | -0.75 | -4.077 | -22.157 |  |  |
| 5.44123847601735 | -0.746 | -4.059 | -22.085 |  |  |
| 5.447521661324528 | -0.742 | -4.041 | -22.012 |  |  |
| 5.453804846631708 | -0.738 | -4.022 | -21.937 |  |  |
| 5.460088031938887 | -0.733 | -4.004 | -21.86 |  |  |
| 5.466371217246066 | -0.729 | -3.985 | -21.782 |  |  |
| 5.472654402553245 | -0.725 | -3.966 | -21.703 |  |  |
| 5.478937587860424 | -0.72 | -3.947 | -21.623 |  |  |
| 5.485220773167603 | -0.716 | -3.927 | -21.541 |  |  |
| 5.491503958474783 | -0.712 | -3.907 | -21.458 |  |  |
| 5.497787143781962 | -0.707 | -3.888 | -21.373 |  |  |
| 5.504070329089141 | -0.703 | -3.867 | -21.287 |  |  |
| 5.51035351439632 | -0.698 | -3.847 | -21.199 |  |  |
| 5.5166366997035 | -0.694 | -3.827 | -21.11 |  |  |
| 5.522919885010679 | -0.689 | -3.806 | -21.02 |  |  |
| 5.529203070317858 | -0.685 | -3.785 | -20.928 |  |  |
| 5.535486255625037 | -0.68 | -3.764 | -20.835 |  |  |
| 5.541769440932216 | -0.675 | -3.743 | -20.74 |  |  |
| 5.548052626239396 | -0.671 | -3.721 | -20.644 |  |  |
| 5.554335811546575 | -0.666 | -3.699 | -20.547 |  |  |
| 5.560618996853754 | -0.661 | -3.677 | -20.448 |  |  |
| 5.566902182160933 | -0.657 | -3.655 | -20.348 |  |  |
| 5.573185367468112 | -0.652 | -3.633 | -20.246 |  |  |
| 5.579468552775292 | -0.647 | -3.61 | -20.143 |  |  |
| 5.585751738082471 | -0.642 | -3.587 | -20.039 |  |  |
| 5.59203492338965 | -0.637 | -3.564 | -19.933 |  |  |
| 5.59831810869683 | -0.633 | -3.541 | -19.825 |  |  |
| 5.604601294004008 | -0.628 | -3.518 | -19.717 |  |  |
| 5.610884479311188 | -0.623 | -3.494 | -19.607 |  |  |
| 5.617167664618367 | -0.618 | -3.471 | -19.495 |  |  |
| 5.623450849925546 | -0.613 | -3.447 | -19.382 |  |  |
| 5.629734035232725 | -0.608 | -3.422 | -19.268 |  |  |
| 5.636017220539904 | -0.603 | -3.398 | -19.152 |  |  |
| 5.642300405847083 | -0.598 | -3.374 | -19.035 |  |  |
| 5.648583591154263 | -0.593 | -3.349 | -18.916 |  |  |
| 5.654866776461442 | -0.588 | -3.324 | -18.796 |  |  |
| 5.661149961768621 | -0.583 | -3.299 | -18.674 |  |  |
| 5.6674331470758 | -0.578 | -3.273 | -18.552 |  |  |
| 5.673716332382979 | -0.572 | -3.248 | -18.427 |  |  |
| 5.679999517690159 | -0.567 | -3.222 | -18.301 |  |  |
| 5.686282702997337 | -0.562 | -3.196 | -18.174 |  |  |
| 5.692565888304517 | -0.557 | -3.17 | -18.046 |  |  |
| 5.698849073611696 | -0.552 | -3.144 | -17.916 |  |  |
| 5.705132258918875 | -0.546 | -3.117 | -17.784 |  |  |
| 5.711415444226055 | -0.541 | -3.091 | -17.652 |  |  |
| 5.717698629533234 | -0.536 | -3.064 | -17.517 |  |  |
| 5.723981814840413 | -0.531 | -3.037 | -17.382 |  |  |
| 5.730265000147592 | -0.525 | -3.009 | -17.245 |  |  |
| 5.73654818545477 | -0.52 | -2.982 | -17.106 |  |  |
| 5.742831370761951 | -0.514 | -2.954 | -16.966 |  |  |
| 5.74911455606913 | -0.509 | -2.927 | -16.825 |  |  |
| 5.75539774137631 | -0.504 | -2.899 | -16.682 |  |  |
| 5.761680926683488 | -0.498 | -2.87 | -16.538 |  |  |
| 5.767964111990667 | -0.493 | -2.842 | -16.393 |  |  |
| 5.774247297297846 | -0.487 | -2.814 | -16.246 |  |  |
| 5.780530482605025 | -0.482 | -2.785 | -16.098 |  |  |
| 5.786813667912205 | -0.476 | -2.756 | -15.948 |  |  |
| 5.793096853219384 | -0.471 | -2.727 | -15.797 |  |  |
| 5.799380038526563 | -0.465 | -2.698 | -15.644 |  |  |
| 5.805663223833742 | -0.46 | -2.668 | -15.49 |  |  |
| 5.811946409140922 | -0.454 | -2.639 | -15.335 |  |  |
| 5.8182295944481 | -0.448 | -2.609 | -15.179 |  |  |
| 5.82451277975528 | -0.443 | -2.579 | -15.021 |  |  |
| 5.830795965062459 | -0.437 | -2.549 | -14.861 |  |  |
| 5.837079150369638 | -0.431 | -2.518 | -14.7 |  |  |
| 5.843362335676817 | -0.426 | -2.488 | -14.538 |  |  |
| 5.849645520983997 | -0.42 | -2.457 | -14.375 |  |  |
| 5.855928706291176 | -0.414 | -2.427 | -14.21 |  |  |
| 5.862211891598355 | -0.409 | -2.396 | -14.043 |  |  |
| 5.868495076905535 | -0.403 | -2.364 | -13.876 |  |  |
| 5.874778262212714 | -0.397 | -2.333 | -13.707 |  |  |
| 5.881061447519893 | -0.391 | -2.302 | -13.536 |  |  |
| 5.887344632827072 | -0.386 | -2.27 | -13.365 |  |  |
| 5.893627818134251 | -0.38 | -2.238 | -13.192 |  |  |
| 5.899911003441431 | -0.374 | -2.206 | -13.017 |  |  |
| 5.90619418874861 | -0.368 | -2.174 | -12.841 |  |  |
| 5.912477374055789 | -0.362 | -2.142 | -12.664 |  |  |
| 5.918760559362968 | -0.356 | -2.11 | -12.486 |  |  |
| 5.925043744670147 | -0.351 | -2.077 | -12.306 |  |  |
| 5.931326929977326 | -0.345 | -2.044 | -12.125 |  |  |
| 5.937610115284505 | -0.339 | -2.011 | -11.942 |  |  |
| 5.943893300591684 | -0.333 | -1.978 | -11.758 |  |  |
| 5.950176485898864 | -0.327 | -1.945 | -11.573 |  |  |
| 5.956459671206043 | -0.321 | -1.912 | -11.387 |  |  |
| 5.962742856513223 | -0.315 | -1.878 | -11.199 |  |  |
| 5.969026041820402 | -0.309 | -1.845 | -11.01 |  |  |
| 5.975309227127581 | -0.303 | -1.811 | -10.82 |  |  |
| 5.98159241243476 | -0.297 | -1.777 | -10.628 |  |  |
| 5.987875597741939 | -0.291 | -1.743 | -10.435 |  |  |
| 5.994158783049118 | -0.285 | -1.708 | -10.241 |  |  |
| 6.000441968356298 | -0.279 | -1.674 | -10.045 |  |  |
| 6.006725153663476 | -0.273 | -1.64 | -9.848 |  |  |
| 6.013008338970656 | -0.267 | -1.605 | -9.65 |  |  |
| 6.019291524277835 | -0.261 | -1.57 | -9.451 |  |  |
| 6.025574709585015 | -0.255 | -1.535 | -9.25 |  |  |
| 6.031857894892193 | -0.249 | -1.5 | -9.048 |  |  |
| 6.038141080199372 | -0.243 | -1.465 | -8.845 |  |  |
| 6.044424265506552 | -0.236 | -1.43 | -8.641 |  |  |
| 6.050707450813731 | -0.23 | -1.394 | -8.435 |  |  |
| 6.05699063612091 | -0.224 | -1.358 | -8.228 |  |  |
| 6.06327382142809 | -0.218 | -1.323 | -8.02 |  |  |
| 6.069557006735269 | -0.212 | -1.287 | -7.81 |  |  |
| 6.075840192042448 | -0.206 | -1.251 | -7.6 |  |  |
| 6.082123377349627 | -0.2 | -1.215 | -7.388 |  |  |
| 6.088406562656806 | -0.194 | -1.178 | -7.175 |  |  |
| 6.094689747963986 | -0.187 | -1.142 | -6.96 |  |  |
| 6.100972933271164 | -0.181 | -1.106 | -6.745 |  |  |
| 6.107256118578344 | -0.175 | -1.069 | -6.528 |  |  |
| 6.113539303885523 | -0.169 | -1.032 | -6.31 |  |  |
| 6.119822489192702 | -0.163 | -0.995 | -6.091 |  |  |
| 6.126105674499882 | -0.156 | -0.958 | -5.871 |  |  |
| 6.132388859807061 | -0.15 | -0.921 | -5.649 |  |  |
| 6.13867204511424 | -0.144 | -0.884 | -5.427 |  |  |
| 6.144955230421419 | -0.138 | -0.847 | -5.203 |  |  |
| 6.151238415728598 | -0.132 | -0.809 | -4.978 |  |  |
| 6.157521601035778 | -0.125 | -0.772 | -4.752 |  |  |
| 6.163804786342957 | -0.119 | -0.734 | -4.525 |  |  |
| 6.170087971650136 | -0.113 | -0.696 | -4.296 |  |  |
| 6.176371156957315 | -0.107 | -0.658 | -4.067 |  |  |
| 6.182654342264494 | -0.1 | -0.621 | -3.836 |  |  |
| 6.188937527571674 | -0.094 | -0.582 | -3.605 |  |  |
| 6.195220712878853 | -0.088 | -0.544 | -3.372 |  |  |
| 6.201503898186032 | -0.082 | -0.506 | -3.138 |  |  |
| 6.207787083493211 | -0.075 | -0.468 | -2.903 |  |  |
| 6.21407026880039 | -0.069 | -0.429 | -2.667 |  |  |
| 6.22035345410757 | -0.063 | -0.391 | -2.43 |  |  |
| 6.226636639414749 | -0.057 | -0.352 | -2.191 |  |  |
| 6.232919824721928 | -0.05 | -0.313 | -1.952 |  |  |
| 6.239203010029107 | -0.044 | -0.274 | -1.712 |  |  |
| 6.245486195336286 | -0.038 | -0.235 | -1.47 |  |  |
| 6.251769380643465 | -0.031 | -0.196 | -1.228 |  |  |
| 6.258052565950644 | -0.025 | -0.157 | -0.984 |  |  |
| 6.264335751257824 | -0.019 | -0.118 | -0.74 |  |  |
| 6.270618936565003 | -0.013 | -0.079 | -0.494 |  |  |
| 6.276902121872182 | -0.006 | -0.039 | -0.248 |  |  |
| 6.283185307179361 | 0 | 0 | 0 |  |  |